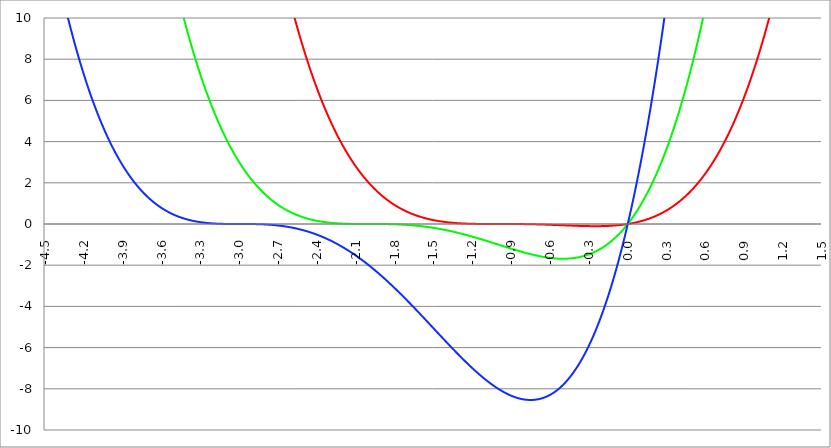
| Category | Series 1 | Series 0 | Series 2 |
|---|---|---|---|
| -4.5 | 192.938 | 70.312 | 15.188 |
| -4.497 | 192.314 | 70.013 | 15.086 |
| -4.494 | 191.691 | 69.714 | 14.986 |
| -4.491 | 191.07 | 69.417 | 14.886 |
| -4.488 | 190.451 | 69.12 | 14.786 |
| -4.484999999999999 | 189.833 | 68.824 | 14.687 |
| -4.482 | 189.216 | 68.529 | 14.589 |
| -4.479 | 188.601 | 68.236 | 14.491 |
| -4.476 | 187.988 | 67.943 | 14.393 |
| -4.472999999999999 | 187.376 | 67.651 | 14.296 |
| -4.469999999999999 | 186.765 | 67.359 | 14.199 |
| -4.466999999999999 | 186.156 | 67.069 | 14.103 |
| -4.463999999999999 | 185.549 | 66.78 | 14.007 |
| -4.460999999999998 | 184.943 | 66.492 | 13.912 |
| -4.457999999999998 | 184.338 | 66.204 | 13.817 |
| -4.454999999999998 | 183.735 | 65.918 | 13.723 |
| -4.451999999999998 | 183.133 | 65.632 | 13.629 |
| -4.448999999999998 | 182.533 | 65.347 | 13.535 |
| -4.445999999999998 | 181.935 | 65.064 | 13.442 |
| -4.442999999999998 | 181.337 | 64.781 | 13.35 |
| -4.439999999999997 | 180.742 | 64.499 | 13.258 |
| -4.436999999999997 | 180.147 | 64.218 | 13.166 |
| -4.433999999999997 | 179.555 | 63.938 | 13.075 |
| -4.430999999999997 | 178.963 | 63.659 | 12.984 |
| -4.427999999999997 | 178.373 | 63.38 | 12.894 |
| -4.424999999999997 | 177.785 | 63.103 | 12.804 |
| -4.421999999999997 | 177.198 | 62.826 | 12.715 |
| -4.418999999999997 | 176.612 | 62.551 | 12.626 |
| -4.415999999999997 | 176.028 | 62.276 | 12.538 |
| -4.412999999999997 | 175.446 | 62.002 | 12.45 |
| -4.409999999999996 | 174.865 | 61.729 | 12.362 |
| -4.406999999999996 | 174.285 | 61.457 | 12.275 |
| -4.403999999999996 | 173.706 | 61.186 | 12.188 |
| -4.400999999999996 | 173.13 | 60.916 | 12.102 |
| -4.397999999999996 | 172.554 | 60.646 | 12.016 |
| -4.394999999999996 | 171.98 | 60.378 | 11.931 |
| -4.391999999999996 | 171.408 | 60.11 | 11.846 |
| -4.388999999999996 | 170.836 | 59.843 | 11.762 |
| -4.385999999999996 | 170.267 | 59.577 | 11.678 |
| -4.382999999999996 | 169.698 | 59.312 | 11.594 |
| -4.379999999999995 | 169.131 | 59.048 | 11.511 |
| -4.376999999999995 | 168.566 | 58.785 | 11.428 |
| -4.373999999999995 | 168.002 | 58.522 | 11.346 |
| -4.370999999999995 | 167.439 | 58.261 | 11.264 |
| -4.367999999999995 | 166.878 | 58 | 11.183 |
| -4.364999999999995 | 166.318 | 57.74 | 11.102 |
| -4.361999999999995 | 165.76 | 57.481 | 11.021 |
| -4.358999999999995 | 165.203 | 57.223 | 10.941 |
| -4.355999999999994 | 164.647 | 56.966 | 10.861 |
| -4.352999999999994 | 164.093 | 56.709 | 10.782 |
| -4.349999999999994 | 163.54 | 56.454 | 10.703 |
| -4.346999999999994 | 162.988 | 56.199 | 10.624 |
| -4.343999999999994 | 162.438 | 55.945 | 10.546 |
| -4.340999999999994 | 161.89 | 55.692 | 10.468 |
| -4.337999999999994 | 161.342 | 55.44 | 10.391 |
| -4.334999999999994 | 160.797 | 55.189 | 10.314 |
| -4.331999999999994 | 160.252 | 54.938 | 10.238 |
| -4.328999999999993 | 159.709 | 54.689 | 10.162 |
| -4.325999999999993 | 159.167 | 54.44 | 10.086 |
| -4.322999999999993 | 158.627 | 54.192 | 10.011 |
| -4.319999999999993 | 158.088 | 53.945 | 9.936 |
| -4.316999999999993 | 157.55 | 53.698 | 9.861 |
| -4.313999999999993 | 157.014 | 53.453 | 9.787 |
| -4.310999999999993 | 156.479 | 53.208 | 9.714 |
| -4.307999999999993 | 155.945 | 52.964 | 9.64 |
| -4.304999999999993 | 155.413 | 52.721 | 9.568 |
| -4.301999999999992 | 154.882 | 52.479 | 9.495 |
| -4.298999999999992 | 154.353 | 52.238 | 9.423 |
| -4.295999999999992 | 153.825 | 51.997 | 9.351 |
| -4.292999999999992 | 153.298 | 51.757 | 9.28 |
| -4.289999999999992 | 152.772 | 51.519 | 9.209 |
| -4.286999999999992 | 152.248 | 51.28 | 9.139 |
| -4.283999999999992 | 151.726 | 51.043 | 9.069 |
| -4.280999999999992 | 151.204 | 50.807 | 8.999 |
| -4.277999999999992 | 150.684 | 50.571 | 8.93 |
| -4.274999999999991 | 150.165 | 50.336 | 8.861 |
| -4.271999999999991 | 149.648 | 50.102 | 8.792 |
| -4.268999999999991 | 149.132 | 49.869 | 8.724 |
| -4.265999999999991 | 148.617 | 49.636 | 8.656 |
| -4.262999999999991 | 148.104 | 49.405 | 8.589 |
| -4.259999999999991 | 147.592 | 49.174 | 8.522 |
| -4.256999999999991 | 147.081 | 48.944 | 8.455 |
| -4.253999999999991 | 146.572 | 48.715 | 8.389 |
| -4.250999999999991 | 146.064 | 48.486 | 8.323 |
| -4.24799999999999 | 145.557 | 48.258 | 8.257 |
| -4.24499999999999 | 145.051 | 48.032 | 8.192 |
| -4.24199999999999 | 144.547 | 47.805 | 8.127 |
| -4.23899999999999 | 144.044 | 47.58 | 8.063 |
| -4.23599999999999 | 143.543 | 47.356 | 7.999 |
| -4.23299999999999 | 143.043 | 47.132 | 7.935 |
| -4.22999999999999 | 142.544 | 46.909 | 7.871 |
| -4.22699999999999 | 142.046 | 46.687 | 7.808 |
| -4.22399999999999 | 141.55 | 46.465 | 7.746 |
| -4.220999999999989 | 141.055 | 46.245 | 7.684 |
| -4.217999999999989 | 140.561 | 46.025 | 7.622 |
| -4.214999999999989 | 140.069 | 45.806 | 7.56 |
| -4.21199999999999 | 139.577 | 45.587 | 7.499 |
| -4.208999999999989 | 139.087 | 45.37 | 7.438 |
| -4.205999999999989 | 138.599 | 45.153 | 7.378 |
| -4.202999999999989 | 138.112 | 44.937 | 7.317 |
| -4.199999999999989 | 137.626 | 44.722 | 7.258 |
| -4.196999999999988 | 137.141 | 44.507 | 7.198 |
| -4.193999999999988 | 136.657 | 44.293 | 7.139 |
| -4.190999999999988 | 136.175 | 44.08 | 7.08 |
| -4.187999999999988 | 135.694 | 43.868 | 7.022 |
| -4.184999999999988 | 135.215 | 43.657 | 6.964 |
| -4.181999999999988 | 134.736 | 43.446 | 6.906 |
| -4.178999999999988 | 134.259 | 43.236 | 6.849 |
| -4.175999999999988 | 133.783 | 43.027 | 6.792 |
| -4.172999999999988 | 133.309 | 42.818 | 6.735 |
| -4.169999999999987 | 132.835 | 42.61 | 6.679 |
| -4.166999999999987 | 132.363 | 42.403 | 6.623 |
| -4.163999999999987 | 131.893 | 42.197 | 6.567 |
| -4.160999999999987 | 131.423 | 41.992 | 6.512 |
| -4.157999999999987 | 130.955 | 41.787 | 6.457 |
| -4.154999999999987 | 130.488 | 41.583 | 6.402 |
| -4.151999999999987 | 130.022 | 41.379 | 6.348 |
| -4.148999999999987 | 129.557 | 41.177 | 6.294 |
| -4.145999999999987 | 129.094 | 40.975 | 6.24 |
| -4.142999999999986 | 128.632 | 40.774 | 6.187 |
| -4.139999999999986 | 128.171 | 40.573 | 6.134 |
| -4.136999999999986 | 127.711 | 40.374 | 6.081 |
| -4.133999999999986 | 127.253 | 40.175 | 6.029 |
| -4.130999999999986 | 126.796 | 39.977 | 5.976 |
| -4.127999999999986 | 126.34 | 39.779 | 5.925 |
| -4.124999999999986 | 125.885 | 39.582 | 5.873 |
| -4.121999999999986 | 125.432 | 39.386 | 5.822 |
| -4.118999999999986 | 124.979 | 39.191 | 5.771 |
| -4.115999999999985 | 124.528 | 38.996 | 5.721 |
| -4.112999999999985 | 124.078 | 38.802 | 5.671 |
| -4.109999999999985 | 123.63 | 38.609 | 5.621 |
| -4.106999999999985 | 123.182 | 38.417 | 5.571 |
| -4.103999999999985 | 122.736 | 38.225 | 5.522 |
| -4.100999999999985 | 122.291 | 38.034 | 5.473 |
| -4.097999999999985 | 121.847 | 37.843 | 5.425 |
| -4.094999999999985 | 121.405 | 37.654 | 5.376 |
| -4.091999999999984 | 120.963 | 37.465 | 5.328 |
| -4.088999999999984 | 120.523 | 37.276 | 5.281 |
| -4.085999999999984 | 120.084 | 37.089 | 5.233 |
| -4.082999999999984 | 119.646 | 36.902 | 5.186 |
| -4.079999999999984 | 119.21 | 36.716 | 5.14 |
| -4.076999999999984 | 118.774 | 36.53 | 5.093 |
| -4.073999999999984 | 118.34 | 36.345 | 5.047 |
| -4.070999999999984 | 117.907 | 36.161 | 5.001 |
| -4.067999999999984 | 117.475 | 35.978 | 4.956 |
| -4.064999999999984 | 117.045 | 35.795 | 4.91 |
| -4.061999999999983 | 116.615 | 35.613 | 4.865 |
| -4.058999999999983 | 116.187 | 35.431 | 4.821 |
| -4.055999999999983 | 115.76 | 35.251 | 4.776 |
| -4.052999999999983 | 115.334 | 35.071 | 4.732 |
| -4.049999999999983 | 114.909 | 34.891 | 4.688 |
| -4.046999999999983 | 114.486 | 34.713 | 4.645 |
| -4.043999999999983 | 114.063 | 34.535 | 4.602 |
| -4.040999999999983 | 113.642 | 34.357 | 4.559 |
| -4.037999999999982 | 113.222 | 34.181 | 4.516 |
| -4.034999999999982 | 112.803 | 34.005 | 4.474 |
| -4.031999999999982 | 112.385 | 33.829 | 4.432 |
| -4.028999999999982 | 111.968 | 33.655 | 4.39 |
| -4.025999999999982 | 111.553 | 33.481 | 4.348 |
| -4.022999999999982 | 111.138 | 33.307 | 4.307 |
| -4.019999999999982 | 110.725 | 33.134 | 4.266 |
| -4.016999999999982 | 110.313 | 32.962 | 4.225 |
| -4.013999999999982 | 109.902 | 32.791 | 4.185 |
| -4.010999999999981 | 109.493 | 32.62 | 4.145 |
| -4.007999999999981 | 109.084 | 32.45 | 4.105 |
| -4.004999999999981 | 108.677 | 32.281 | 4.065 |
| -4.001999999999981 | 108.27 | 32.112 | 4.026 |
| -3.998999999999981 | 107.865 | 31.944 | 3.987 |
| -3.995999999999981 | 107.461 | 31.777 | 3.948 |
| -3.992999999999981 | 107.058 | 31.61 | 3.91 |
| -3.989999999999981 | 106.656 | 31.444 | 3.871 |
| -3.986999999999981 | 106.256 | 31.278 | 3.834 |
| -3.98399999999998 | 105.856 | 31.113 | 3.796 |
| -3.98099999999998 | 105.458 | 30.949 | 3.758 |
| -3.97799999999998 | 105.06 | 30.785 | 3.721 |
| -3.97499999999998 | 104.664 | 30.622 | 3.684 |
| -3.97199999999998 | 104.269 | 30.46 | 3.648 |
| -3.96899999999998 | 103.875 | 30.298 | 3.611 |
| -3.96599999999998 | 103.482 | 30.137 | 3.575 |
| -3.96299999999998 | 103.091 | 29.977 | 3.539 |
| -3.95999999999998 | 102.7 | 29.817 | 3.504 |
| -3.956999999999979 | 102.31 | 29.658 | 3.468 |
| -3.953999999999979 | 101.922 | 29.499 | 3.433 |
| -3.950999999999979 | 101.535 | 29.341 | 3.398 |
| -3.94799999999998 | 101.149 | 29.184 | 3.364 |
| -3.944999999999979 | 100.763 | 29.027 | 3.329 |
| -3.941999999999979 | 100.379 | 28.871 | 3.295 |
| -3.938999999999979 | 99.996 | 28.716 | 3.261 |
| -3.935999999999979 | 99.615 | 28.561 | 3.228 |
| -3.932999999999978 | 99.234 | 28.407 | 3.194 |
| -3.929999999999978 | 98.854 | 28.253 | 3.161 |
| -3.926999999999978 | 98.476 | 28.1 | 3.128 |
| -3.923999999999978 | 98.098 | 27.948 | 3.096 |
| -3.920999999999978 | 97.722 | 27.796 | 3.063 |
| -3.917999999999978 | 97.346 | 27.645 | 3.031 |
| -3.914999999999978 | 96.972 | 27.494 | 2.999 |
| -3.911999999999978 | 96.599 | 27.344 | 2.967 |
| -3.908999999999978 | 96.227 | 27.195 | 2.936 |
| -3.905999999999977 | 95.856 | 27.046 | 2.905 |
| -3.902999999999977 | 95.486 | 26.898 | 2.874 |
| -3.899999999999977 | 95.117 | 26.75 | 2.843 |
| -3.896999999999977 | 94.749 | 26.603 | 2.813 |
| -3.893999999999977 | 94.383 | 26.457 | 2.782 |
| -3.890999999999977 | 94.017 | 26.311 | 2.752 |
| -3.887999999999977 | 93.652 | 26.166 | 2.722 |
| -3.884999999999977 | 93.289 | 26.021 | 2.693 |
| -3.881999999999977 | 92.926 | 25.877 | 2.664 |
| -3.878999999999976 | 92.565 | 25.734 | 2.634 |
| -3.875999999999976 | 92.204 | 25.591 | 2.606 |
| -3.872999999999976 | 91.845 | 25.448 | 2.577 |
| -3.869999999999976 | 91.486 | 25.307 | 2.548 |
| -3.866999999999976 | 91.129 | 25.166 | 2.52 |
| -3.863999999999976 | 90.773 | 25.025 | 2.492 |
| -3.860999999999976 | 90.418 | 24.885 | 2.464 |
| -3.857999999999976 | 90.064 | 24.746 | 2.437 |
| -3.854999999999976 | 89.71 | 24.607 | 2.409 |
| -3.851999999999975 | 89.358 | 24.469 | 2.382 |
| -3.848999999999975 | 89.007 | 24.331 | 2.355 |
| -3.845999999999975 | 88.657 | 24.194 | 2.329 |
| -3.842999999999975 | 88.308 | 24.057 | 2.302 |
| -3.839999999999975 | 87.96 | 23.921 | 2.276 |
| -3.836999999999975 | 87.613 | 23.786 | 2.25 |
| -3.833999999999975 | 87.267 | 23.651 | 2.224 |
| -3.830999999999975 | 86.922 | 23.517 | 2.198 |
| -3.827999999999974 | 86.579 | 23.383 | 2.173 |
| -3.824999999999974 | 86.236 | 23.25 | 2.148 |
| -3.821999999999974 | 85.894 | 23.117 | 2.123 |
| -3.818999999999974 | 85.553 | 22.985 | 2.098 |
| -3.815999999999974 | 85.213 | 22.854 | 2.073 |
| -3.812999999999974 | 84.874 | 22.723 | 2.049 |
| -3.809999999999974 | 84.536 | 22.592 | 2.025 |
| -3.806999999999974 | 84.2 | 22.462 | 2.001 |
| -3.803999999999974 | 83.864 | 22.333 | 1.977 |
| -3.800999999999973 | 83.529 | 22.204 | 1.953 |
| -3.797999999999973 | 83.195 | 22.076 | 1.93 |
| -3.794999999999973 | 82.862 | 21.949 | 1.907 |
| -3.791999999999973 | 82.531 | 21.821 | 1.884 |
| -3.788999999999973 | 82.2 | 21.695 | 1.861 |
| -3.785999999999973 | 81.87 | 21.569 | 1.838 |
| -3.782999999999973 | 81.541 | 21.443 | 1.816 |
| -3.779999999999973 | 81.213 | 21.318 | 1.794 |
| -3.776999999999973 | 80.886 | 21.194 | 1.772 |
| -3.773999999999972 | 80.56 | 21.07 | 1.75 |
| -3.770999999999972 | 80.235 | 20.947 | 1.728 |
| -3.767999999999972 | 79.911 | 20.824 | 1.707 |
| -3.764999999999972 | 79.589 | 20.701 | 1.686 |
| -3.761999999999972 | 79.267 | 20.58 | 1.664 |
| -3.758999999999972 | 78.946 | 20.458 | 1.644 |
| -3.755999999999972 | 78.625 | 20.338 | 1.623 |
| -3.752999999999972 | 78.306 | 20.217 | 1.602 |
| -3.749999999999972 | 77.988 | 20.098 | 1.582 |
| -3.746999999999971 | 77.671 | 19.978 | 1.562 |
| -3.743999999999971 | 77.355 | 19.86 | 1.542 |
| -3.740999999999971 | 77.04 | 19.742 | 1.522 |
| -3.737999999999971 | 76.725 | 19.624 | 1.502 |
| -3.734999999999971 | 76.412 | 19.507 | 1.483 |
| -3.731999999999971 | 76.1 | 19.39 | 1.464 |
| -3.728999999999971 | 75.788 | 19.274 | 1.445 |
| -3.725999999999971 | 75.478 | 19.159 | 1.426 |
| -3.72299999999997 | 75.169 | 19.044 | 1.407 |
| -3.71999999999997 | 74.86 | 18.929 | 1.388 |
| -3.71699999999997 | 74.552 | 18.815 | 1.37 |
| -3.71399999999997 | 74.246 | 18.701 | 1.352 |
| -3.71099999999997 | 73.94 | 18.588 | 1.334 |
| -3.70799999999997 | 73.635 | 18.476 | 1.316 |
| -3.70499999999997 | 73.331 | 18.364 | 1.298 |
| -3.70199999999997 | 73.029 | 18.252 | 1.281 |
| -3.69899999999997 | 72.727 | 18.141 | 1.263 |
| -3.695999999999969 | 72.426 | 18.031 | 1.246 |
| -3.692999999999969 | 72.125 | 17.921 | 1.229 |
| -3.689999999999969 | 71.826 | 17.811 | 1.212 |
| -3.686999999999969 | 71.528 | 17.702 | 1.195 |
| -3.683999999999969 | 71.231 | 17.593 | 1.179 |
| -3.680999999999969 | 70.934 | 17.485 | 1.163 |
| -3.677999999999969 | 70.639 | 17.378 | 1.146 |
| -3.674999999999969 | 70.344 | 17.27 | 1.13 |
| -3.671999999999969 | 70.051 | 17.164 | 1.114 |
| -3.668999999999968 | 69.758 | 17.058 | 1.099 |
| -3.665999999999968 | 69.466 | 16.952 | 1.083 |
| -3.662999999999968 | 69.175 | 16.847 | 1.068 |
| -3.659999999999968 | 68.885 | 16.742 | 1.052 |
| -3.656999999999968 | 68.596 | 16.638 | 1.037 |
| -3.653999999999968 | 68.308 | 16.534 | 1.022 |
| -3.650999999999968 | 68.021 | 16.431 | 1.007 |
| -3.647999999999968 | 67.734 | 16.328 | 0.993 |
| -3.644999999999968 | 67.449 | 16.225 | 0.978 |
| -3.641999999999967 | 67.164 | 16.124 | 0.964 |
| -3.638999999999967 | 66.881 | 16.022 | 0.949 |
| -3.635999999999967 | 66.598 | 15.921 | 0.935 |
| -3.632999999999967 | 66.316 | 15.821 | 0.921 |
| -3.629999999999967 | 66.035 | 15.721 | 0.908 |
| -3.626999999999967 | 65.755 | 15.621 | 0.894 |
| -3.623999999999967 | 65.476 | 15.522 | 0.881 |
| -3.620999999999967 | 65.197 | 15.423 | 0.867 |
| -3.617999999999966 | 64.92 | 15.325 | 0.854 |
| -3.614999999999966 | 64.643 | 15.227 | 0.841 |
| -3.611999999999966 | 64.368 | 15.13 | 0.828 |
| -3.608999999999966 | 64.093 | 15.033 | 0.815 |
| -3.605999999999966 | 63.819 | 14.937 | 0.802 |
| -3.602999999999966 | 63.546 | 14.841 | 0.79 |
| -3.599999999999966 | 63.274 | 14.746 | 0.778 |
| -3.596999999999966 | 63.002 | 14.651 | 0.765 |
| -3.593999999999966 | 62.732 | 14.556 | 0.753 |
| -3.590999999999966 | 62.462 | 14.462 | 0.741 |
| -3.587999999999965 | 62.194 | 14.368 | 0.729 |
| -3.584999999999965 | 61.926 | 14.275 | 0.718 |
| -3.581999999999965 | 61.659 | 14.182 | 0.706 |
| -3.578999999999965 | 61.393 | 14.09 | 0.695 |
| -3.575999999999965 | 61.127 | 13.998 | 0.683 |
| -3.572999999999965 | 60.863 | 13.907 | 0.672 |
| -3.569999999999965 | 60.599 | 13.816 | 0.661 |
| -3.566999999999965 | 60.337 | 13.725 | 0.65 |
| -3.563999999999965 | 60.075 | 13.635 | 0.639 |
| -3.560999999999964 | 59.814 | 13.545 | 0.629 |
| -3.557999999999964 | 59.554 | 13.456 | 0.618 |
| -3.554999999999964 | 59.294 | 13.367 | 0.608 |
| -3.551999999999964 | 59.036 | 13.278 | 0.597 |
| -3.548999999999964 | 58.778 | 13.19 | 0.587 |
| -3.545999999999964 | 58.521 | 13.103 | 0.577 |
| -3.542999999999964 | 58.265 | 13.016 | 0.567 |
| -3.539999999999964 | 58.01 | 12.929 | 0.557 |
| -3.536999999999963 | 57.756 | 12.843 | 0.548 |
| -3.533999999999963 | 57.502 | 12.757 | 0.538 |
| -3.530999999999963 | 57.25 | 12.671 | 0.529 |
| -3.527999999999963 | 56.998 | 12.586 | 0.519 |
| -3.524999999999963 | 56.747 | 12.502 | 0.51 |
| -3.521999999999963 | 56.497 | 12.417 | 0.501 |
| -3.518999999999963 | 56.248 | 12.334 | 0.492 |
| -3.515999999999963 | 55.999 | 12.25 | 0.483 |
| -3.512999999999963 | 55.751 | 12.167 | 0.474 |
| -3.509999999999962 | 55.505 | 12.085 | 0.466 |
| -3.506999999999962 | 55.258 | 12.003 | 0.457 |
| -3.503999999999962 | 55.013 | 11.921 | 0.449 |
| -3.500999999999962 | 54.769 | 11.84 | 0.44 |
| -3.497999999999962 | 54.525 | 11.759 | 0.432 |
| -3.494999999999962 | 54.282 | 11.678 | 0.424 |
| -3.491999999999962 | 54.04 | 11.598 | 0.416 |
| -3.488999999999962 | 53.799 | 11.518 | 0.408 |
| -3.485999999999962 | 53.559 | 11.439 | 0.4 |
| -3.482999999999961 | 53.319 | 11.36 | 0.392 |
| -3.479999999999961 | 53.08 | 11.281 | 0.385 |
| -3.476999999999961 | 52.842 | 11.203 | 0.377 |
| -3.473999999999961 | 52.605 | 11.126 | 0.37 |
| -3.470999999999961 | 52.369 | 11.048 | 0.363 |
| -3.467999999999961 | 52.133 | 10.971 | 0.355 |
| -3.464999999999961 | 51.898 | 10.895 | 0.348 |
| -3.461999999999961 | 51.664 | 10.819 | 0.341 |
| -3.458999999999961 | 51.431 | 10.743 | 0.334 |
| -3.45599999999996 | 51.199 | 10.667 | 0.328 |
| -3.45299999999996 | 50.967 | 10.592 | 0.321 |
| -3.44999999999996 | 50.736 | 10.518 | 0.314 |
| -3.44699999999996 | 50.506 | 10.444 | 0.308 |
| -3.44399999999996 | 50.277 | 10.37 | 0.301 |
| -3.44099999999996 | 50.048 | 10.296 | 0.295 |
| -3.43799999999996 | 49.82 | 10.223 | 0.289 |
| -3.43499999999996 | 49.593 | 10.15 | 0.283 |
| -3.431999999999959 | 49.367 | 10.078 | 0.277 |
| -3.428999999999959 | 49.142 | 10.006 | 0.271 |
| -3.425999999999959 | 48.917 | 9.934 | 0.265 |
| -3.422999999999959 | 48.693 | 9.863 | 0.259 |
| -3.419999999999959 | 48.47 | 9.792 | 0.253 |
| -3.416999999999959 | 48.248 | 9.722 | 0.248 |
| -3.413999999999959 | 48.026 | 9.652 | 0.242 |
| -3.410999999999959 | 47.805 | 9.582 | 0.237 |
| -3.407999999999959 | 47.585 | 9.513 | 0.231 |
| -3.404999999999958 | 47.366 | 9.444 | 0.226 |
| -3.401999999999958 | 47.147 | 9.375 | 0.221 |
| -3.398999999999958 | 46.929 | 9.307 | 0.216 |
| -3.395999999999958 | 46.712 | 9.239 | 0.211 |
| -3.392999999999958 | 46.496 | 9.171 | 0.206 |
| -3.389999999999958 | 46.28 | 9.104 | 0.201 |
| -3.386999999999958 | 46.065 | 9.037 | 0.196 |
| -3.383999999999958 | 45.851 | 8.971 | 0.192 |
| -3.380999999999958 | 45.638 | 8.905 | 0.187 |
| -3.377999999999957 | 45.425 | 8.839 | 0.182 |
| -3.374999999999957 | 45.213 | 8.774 | 0.178 |
| -3.371999999999957 | 45.002 | 8.709 | 0.174 |
| -3.368999999999957 | 44.792 | 8.644 | 0.169 |
| -3.365999999999957 | 44.582 | 8.58 | 0.165 |
| -3.362999999999957 | 44.373 | 8.516 | 0.161 |
| -3.359999999999957 | 44.165 | 8.452 | 0.157 |
| -3.356999999999957 | 43.957 | 8.389 | 0.153 |
| -3.353999999999957 | 43.75 | 8.326 | 0.149 |
| -3.350999999999956 | 43.544 | 8.263 | 0.145 |
| -3.347999999999956 | 43.339 | 8.201 | 0.141 |
| -3.344999999999956 | 43.134 | 8.139 | 0.137 |
| -3.341999999999956 | 42.931 | 8.077 | 0.134 |
| -3.338999999999956 | 42.727 | 8.016 | 0.13 |
| -3.335999999999956 | 42.525 | 7.955 | 0.127 |
| -3.332999999999956 | 42.323 | 7.895 | 0.123 |
| -3.329999999999956 | 42.122 | 7.834 | 0.12 |
| -3.326999999999955 | 41.922 | 7.774 | 0.116 |
| -3.323999999999955 | 41.722 | 7.715 | 0.113 |
| -3.320999999999955 | 41.524 | 7.656 | 0.11 |
| -3.317999999999955 | 41.325 | 7.597 | 0.107 |
| -3.314999999999955 | 41.128 | 7.538 | 0.104 |
| -3.311999999999955 | 40.931 | 7.48 | 0.101 |
| -3.308999999999955 | 40.735 | 7.422 | 0.098 |
| -3.305999999999955 | 40.54 | 7.364 | 0.095 |
| -3.302999999999955 | 40.345 | 7.307 | 0.092 |
| -3.299999999999954 | 40.151 | 7.25 | 0.089 |
| -3.296999999999954 | 39.958 | 7.193 | 0.086 |
| -3.293999999999954 | 39.765 | 7.137 | 0.084 |
| -3.290999999999954 | 39.573 | 7.081 | 0.081 |
| -3.287999999999954 | 39.382 | 7.026 | 0.079 |
| -3.284999999999954 | 39.192 | 6.97 | 0.076 |
| -3.281999999999954 | 39.002 | 6.915 | 0.074 |
| -3.278999999999954 | 38.813 | 6.86 | 0.071 |
| -3.275999999999954 | 38.624 | 6.806 | 0.069 |
| -3.272999999999953 | 38.437 | 6.752 | 0.067 |
| -3.269999999999953 | 38.249 | 6.698 | 0.064 |
| -3.266999999999953 | 38.063 | 6.645 | 0.062 |
| -3.263999999999953 | 37.877 | 6.592 | 0.06 |
| -3.260999999999953 | 37.692 | 6.539 | 0.058 |
| -3.257999999999953 | 37.508 | 6.486 | 0.056 |
| -3.254999999999953 | 37.324 | 6.434 | 0.054 |
| -3.251999999999953 | 37.141 | 6.382 | 0.052 |
| -3.248999999999952 | 36.959 | 6.33 | 0.05 |
| -3.245999999999952 | 36.777 | 6.279 | 0.048 |
| -3.242999999999952 | 36.596 | 6.228 | 0.047 |
| -3.239999999999952 | 36.416 | 6.177 | 0.045 |
| -3.236999999999952 | 36.236 | 6.127 | 0.043 |
| -3.233999999999952 | 36.057 | 6.077 | 0.041 |
| -3.230999999999952 | 35.879 | 6.027 | 0.04 |
| -3.227999999999952 | 35.701 | 5.978 | 0.038 |
| -3.224999999999952 | 35.524 | 5.928 | 0.037 |
| -3.221999999999952 | 35.347 | 5.879 | 0.035 |
| -3.218999999999951 | 35.172 | 5.831 | 0.034 |
| -3.215999999999951 | 34.997 | 5.783 | 0.032 |
| -3.212999999999951 | 34.822 | 5.734 | 0.031 |
| -3.209999999999951 | 34.648 | 5.687 | 0.03 |
| -3.206999999999951 | 34.475 | 5.639 | 0.028 |
| -3.203999999999951 | 34.303 | 5.592 | 0.027 |
| -3.200999999999951 | 34.131 | 5.545 | 0.026 |
| -3.197999999999951 | 33.96 | 5.499 | 0.025 |
| -3.194999999999951 | 33.789 | 5.452 | 0.024 |
| -3.19199999999995 | 33.619 | 5.406 | 0.023 |
| -3.18899999999995 | 33.45 | 5.36 | 0.022 |
| -3.18599999999995 | 33.281 | 5.315 | 0.021 |
| -3.18299999999995 | 33.113 | 5.27 | 0.02 |
| -3.17999999999995 | 32.946 | 5.225 | 0.019 |
| -3.17699999999995 | 32.779 | 5.18 | 0.018 |
| -3.17399999999995 | 32.613 | 5.136 | 0.017 |
| -3.17099999999995 | 32.447 | 5.092 | 0.016 |
| -3.16799999999995 | 32.282 | 5.048 | 0.015 |
| -3.164999999999949 | 32.118 | 5.004 | 0.014 |
| -3.161999999999949 | 31.954 | 4.961 | 0.013 |
| -3.158999999999949 | 31.791 | 4.918 | 0.013 |
| -3.155999999999949 | 31.629 | 4.875 | 0.012 |
| -3.152999999999949 | 31.467 | 4.833 | 0.011 |
| -3.149999999999949 | 31.306 | 4.791 | 0.011 |
| -3.146999999999949 | 31.145 | 4.749 | 0.01 |
| -3.143999999999949 | 30.985 | 4.707 | 0.009 |
| -3.140999999999948 | 30.826 | 4.666 | 0.009 |
| -3.137999999999948 | 30.667 | 4.625 | 0.008 |
| -3.134999999999948 | 30.509 | 4.584 | 0.008 |
| -3.131999999999948 | 30.352 | 4.543 | 0.007 |
| -3.128999999999948 | 30.195 | 4.503 | 0.007 |
| -3.125999999999948 | 30.039 | 4.463 | 0.006 |
| -3.122999999999948 | 29.883 | 4.423 | 0.006 |
| -3.119999999999948 | 29.728 | 4.383 | 0.005 |
| -3.116999999999948 | 29.573 | 4.344 | 0.005 |
| -3.113999999999947 | 29.419 | 4.305 | 0.005 |
| -3.110999999999947 | 29.266 | 4.266 | 0.004 |
| -3.107999999999947 | 29.113 | 4.228 | 0.004 |
| -3.104999999999947 | 28.961 | 4.189 | 0.004 |
| -3.101999999999947 | 28.81 | 4.151 | 0.003 |
| -3.098999999999947 | 28.659 | 4.114 | 0.003 |
| -3.095999999999947 | 28.509 | 4.076 | 0.003 |
| -3.092999999999947 | 28.359 | 4.039 | 0.002 |
| -3.089999999999947 | 28.21 | 4.002 | 0.002 |
| -3.086999999999946 | 28.061 | 3.965 | 0.002 |
| -3.083999999999946 | 27.913 | 3.928 | 0.002 |
| -3.080999999999946 | 27.766 | 3.892 | 0.002 |
| -3.077999999999946 | 27.619 | 3.856 | 0.001 |
| -3.074999999999946 | 27.473 | 3.82 | 0.001 |
| -3.071999999999946 | 27.327 | 3.784 | 0.001 |
| -3.068999999999946 | 27.182 | 3.749 | 0.001 |
| -3.065999999999946 | 27.037 | 3.714 | 0.001 |
| -3.062999999999946 | 26.893 | 3.679 | 0.001 |
| -3.059999999999945 | 26.75 | 3.645 | 0.001 |
| -3.056999999999945 | 26.607 | 3.61 | 0.001 |
| -3.053999999999945 | 26.465 | 3.576 | 0 |
| -3.050999999999945 | 26.323 | 3.542 | 0 |
| -3.047999999999945 | 26.182 | 3.508 | 0 |
| -3.044999999999945 | 26.042 | 3.475 | 0 |
| -3.041999999999945 | 25.902 | 3.442 | 0 |
| -3.038999999999945 | 25.762 | 3.409 | 0 |
| -3.035999999999945 | 25.623 | 3.376 | 0 |
| -3.032999999999944 | 25.485 | 3.343 | 0 |
| -3.029999999999944 | 25.347 | 3.311 | 0 |
| -3.026999999999944 | 25.21 | 3.279 | 0 |
| -3.023999999999944 | 25.073 | 3.247 | 0 |
| -3.020999999999944 | 24.937 | 3.215 | 0 |
| -3.017999999999944 | 24.802 | 3.184 | 0 |
| -3.014999999999944 | 24.667 | 3.153 | 0 |
| -3.011999999999944 | 24.532 | 3.122 | 0 |
| -3.008999999999943 | 24.398 | 3.091 | 0 |
| -3.005999999999943 | 24.265 | 3.06 | 0 |
| -3.002999999999943 | 24.132 | 3.03 | 0 |
| -2.999999999999943 | 24 | 3 | 0 |
| -2.996999999999943 | 23.868 | 2.97 | 0 |
| -2.993999999999943 | 23.737 | 2.94 | 0 |
| -2.990999999999943 | 23.606 | 2.911 | 0 |
| -2.987999999999943 | 23.476 | 2.882 | 0 |
| -2.984999999999943 | 23.347 | 2.853 | 0 |
| -2.981999999999942 | 23.218 | 2.824 | 0 |
| -2.978999999999942 | 23.089 | 2.795 | 0 |
| -2.975999999999942 | 22.961 | 2.767 | 0 |
| -2.972999999999942 | 22.834 | 2.739 | 0 |
| -2.969999999999942 | 22.707 | 2.711 | 0 |
| -2.966999999999942 | 22.58 | 2.683 | 0 |
| -2.963999999999942 | 22.454 | 2.655 | 0 |
| -2.960999999999942 | 22.329 | 2.628 | 0 |
| -2.957999999999942 | 22.204 | 2.601 | 0 |
| -2.954999999999941 | 22.08 | 2.574 | 0 |
| -2.951999999999941 | 21.956 | 2.547 | 0 |
| -2.948999999999941 | 21.833 | 2.52 | 0 |
| -2.945999999999941 | 21.71 | 2.494 | 0 |
| -2.942999999999941 | 21.588 | 2.468 | -0.001 |
| -2.939999999999941 | 21.466 | 2.442 | -0.001 |
| -2.936999999999941 | 21.345 | 2.416 | -0.001 |
| -2.933999999999941 | 21.224 | 2.391 | -0.001 |
| -2.930999999999941 | 21.104 | 2.365 | -0.001 |
| -2.92799999999994 | 20.984 | 2.34 | -0.001 |
| -2.92499999999994 | 20.865 | 2.315 | -0.001 |
| -2.92199999999994 | 20.746 | 2.29 | -0.001 |
| -2.91899999999994 | 20.628 | 2.266 | -0.002 |
| -2.91599999999994 | 20.51 | 2.241 | -0.002 |
| -2.91299999999994 | 20.393 | 2.217 | -0.002 |
| -2.90999999999994 | 20.277 | 2.193 | -0.002 |
| -2.90699999999994 | 20.16 | 2.169 | -0.002 |
| -2.903999999999939 | 20.045 | 2.145 | -0.003 |
| -2.900999999999939 | 19.929 | 2.122 | -0.003 |
| -2.897999999999939 | 19.815 | 2.099 | -0.003 |
| -2.894999999999939 | 19.7 | 2.075 | -0.003 |
| -2.891999999999939 | 19.587 | 2.053 | -0.004 |
| -2.888999999999939 | 19.473 | 2.03 | -0.004 |
| -2.885999999999939 | 19.361 | 2.007 | -0.004 |
| -2.882999999999939 | 19.248 | 1.985 | -0.005 |
| -2.879999999999939 | 19.137 | 1.963 | -0.005 |
| -2.876999999999938 | 19.025 | 1.941 | -0.005 |
| -2.873999999999938 | 18.915 | 1.919 | -0.006 |
| -2.870999999999938 | 18.804 | 1.897 | -0.006 |
| -2.867999999999938 | 18.694 | 1.876 | -0.007 |
| -2.864999999999938 | 18.585 | 1.854 | -0.007 |
| -2.861999999999938 | 18.476 | 1.833 | -0.008 |
| -2.858999999999938 | 18.368 | 1.812 | -0.008 |
| -2.855999999999938 | 18.26 | 1.791 | -0.009 |
| -2.852999999999938 | 18.152 | 1.771 | -0.009 |
| -2.849999999999937 | 18.045 | 1.75 | -0.01 |
| -2.846999999999937 | 17.939 | 1.73 | -0.01 |
| -2.843999999999937 | 17.833 | 1.71 | -0.011 |
| -2.840999999999937 | 17.727 | 1.69 | -0.011 |
| -2.837999999999937 | 17.622 | 1.67 | -0.012 |
| -2.834999999999937 | 17.517 | 1.65 | -0.013 |
| -2.831999999999937 | 17.413 | 1.631 | -0.013 |
| -2.828999999999937 | 17.309 | 1.612 | -0.014 |
| -2.825999999999937 | 17.206 | 1.593 | -0.015 |
| -2.822999999999936 | 17.103 | 1.574 | -0.016 |
| -2.819999999999936 | 17.001 | 1.555 | -0.016 |
| -2.816999999999936 | 16.899 | 1.536 | -0.017 |
| -2.813999999999936 | 16.797 | 1.518 | -0.018 |
| -2.810999999999936 | 16.696 | 1.499 | -0.019 |
| -2.807999999999936 | 16.596 | 1.481 | -0.02 |
| -2.804999999999936 | 16.495 | 1.463 | -0.021 |
| -2.801999999999936 | 16.396 | 1.445 | -0.022 |
| -2.798999999999935 | 16.297 | 1.428 | -0.023 |
| -2.795999999999935 | 16.198 | 1.41 | -0.024 |
| -2.792999999999935 | 16.099 | 1.393 | -0.025 |
| -2.789999999999935 | 16.002 | 1.376 | -0.026 |
| -2.786999999999935 | 15.904 | 1.359 | -0.027 |
| -2.783999999999935 | 15.807 | 1.342 | -0.028 |
| -2.780999999999935 | 15.711 | 1.325 | -0.029 |
| -2.777999999999935 | 15.614 | 1.308 | -0.03 |
| -2.774999999999935 | 15.519 | 1.292 | -0.032 |
| -2.771999999999934 | 15.424 | 1.275 | -0.033 |
| -2.768999999999934 | 15.329 | 1.259 | -0.034 |
| -2.765999999999934 | 15.234 | 1.243 | -0.035 |
| -2.762999999999934 | 15.14 | 1.227 | -0.037 |
| -2.759999999999934 | 15.047 | 1.212 | -0.038 |
| -2.756999999999934 | 14.954 | 1.196 | -0.04 |
| -2.753999999999934 | 14.861 | 1.181 | -0.041 |
| -2.750999999999934 | 14.769 | 1.165 | -0.042 |
| -2.747999999999933 | 14.677 | 1.15 | -0.044 |
| -2.744999999999933 | 14.586 | 1.135 | -0.046 |
| -2.741999999999933 | 14.495 | 1.12 | -0.047 |
| -2.738999999999933 | 14.404 | 1.105 | -0.049 |
| -2.735999999999933 | 14.314 | 1.091 | -0.05 |
| -2.732999999999933 | 14.224 | 1.076 | -0.052 |
| -2.729999999999933 | 14.135 | 1.062 | -0.054 |
| -2.726999999999933 | 14.046 | 1.048 | -0.055 |
| -2.723999999999932 | 13.958 | 1.034 | -0.057 |
| -2.720999999999932 | 13.87 | 1.02 | -0.059 |
| -2.717999999999932 | 13.782 | 1.006 | -0.061 |
| -2.714999999999932 | 13.695 | 0.992 | -0.063 |
| -2.711999999999932 | 13.608 | 0.979 | -0.065 |
| -2.708999999999932 | 13.522 | 0.965 | -0.067 |
| -2.705999999999932 | 13.436 | 0.952 | -0.069 |
| -2.702999999999932 | 13.35 | 0.939 | -0.071 |
| -2.699999999999932 | 13.265 | 0.926 | -0.073 |
| -2.696999999999932 | 13.18 | 0.913 | -0.075 |
| -2.693999999999931 | 13.096 | 0.9 | -0.077 |
| -2.690999999999931 | 13.012 | 0.888 | -0.079 |
| -2.687999999999931 | 12.928 | 0.875 | -0.082 |
| -2.684999999999931 | 12.845 | 0.863 | -0.084 |
| -2.681999999999931 | 12.763 | 0.851 | -0.086 |
| -2.678999999999931 | 12.68 | 0.839 | -0.089 |
| -2.675999999999931 | 12.598 | 0.827 | -0.091 |
| -2.672999999999931 | 12.517 | 0.815 | -0.093 |
| -2.669999999999931 | 12.435 | 0.803 | -0.096 |
| -2.66699999999993 | 12.355 | 0.791 | -0.098 |
| -2.66399999999993 | 12.274 | 0.78 | -0.101 |
| -2.66099999999993 | 12.194 | 0.769 | -0.104 |
| -2.65799999999993 | 12.115 | 0.757 | -0.106 |
| -2.65499999999993 | 12.035 | 0.746 | -0.109 |
| -2.65199999999993 | 11.956 | 0.735 | -0.112 |
| -2.64899999999993 | 11.878 | 0.724 | -0.115 |
| -2.64599999999993 | 11.8 | 0.713 | -0.117 |
| -2.64299999999993 | 11.722 | 0.703 | -0.12 |
| -2.639999999999929 | 11.645 | 0.692 | -0.123 |
| -2.636999999999929 | 11.568 | 0.682 | -0.126 |
| -2.633999999999929 | 11.491 | 0.671 | -0.129 |
| -2.630999999999929 | 11.415 | 0.661 | -0.132 |
| -2.627999999999929 | 11.339 | 0.651 | -0.135 |
| -2.624999999999929 | 11.264 | 0.641 | -0.138 |
| -2.621999999999929 | 11.189 | 0.631 | -0.142 |
| -2.618999999999929 | 11.114 | 0.621 | -0.145 |
| -2.615999999999929 | 11.04 | 0.611 | -0.148 |
| -2.612999999999928 | 10.966 | 0.602 | -0.151 |
| -2.609999999999928 | 10.892 | 0.592 | -0.155 |
| -2.606999999999928 | 10.819 | 0.583 | -0.158 |
| -2.603999999999928 | 10.746 | 0.574 | -0.162 |
| -2.600999999999928 | 10.674 | 0.565 | -0.165 |
| -2.597999999999928 | 10.602 | 0.556 | -0.169 |
| -2.594999999999928 | 10.53 | 0.547 | -0.172 |
| -2.591999999999928 | 10.458 | 0.538 | -0.176 |
| -2.588999999999928 | 10.387 | 0.529 | -0.18 |
| -2.585999999999927 | 10.317 | 0.52 | -0.183 |
| -2.582999999999927 | 10.246 | 0.512 | -0.187 |
| -2.579999999999927 | 10.176 | 0.503 | -0.191 |
| -2.576999999999927 | 10.107 | 0.495 | -0.195 |
| -2.573999999999927 | 10.037 | 0.487 | -0.199 |
| -2.570999999999927 | 9.969 | 0.479 | -0.203 |
| -2.567999999999927 | 9.9 | 0.471 | -0.207 |
| -2.564999999999927 | 9.832 | 0.463 | -0.211 |
| -2.561999999999927 | 9.764 | 0.455 | -0.215 |
| -2.558999999999926 | 9.696 | 0.447 | -0.219 |
| -2.555999999999926 | 9.629 | 0.439 | -0.224 |
| -2.552999999999926 | 9.562 | 0.432 | -0.228 |
| -2.549999999999926 | 9.496 | 0.424 | -0.232 |
| -2.546999999999926 | 9.43 | 0.417 | -0.237 |
| -2.543999999999926 | 9.364 | 0.41 | -0.241 |
| -2.540999999999926 | 9.298 | 0.402 | -0.246 |
| -2.537999999999926 | 9.233 | 0.395 | -0.25 |
| -2.534999999999926 | 9.169 | 0.388 | -0.255 |
| -2.531999999999925 | 9.104 | 0.381 | -0.26 |
| -2.528999999999925 | 9.04 | 0.374 | -0.264 |
| -2.525999999999925 | 8.976 | 0.368 | -0.269 |
| -2.522999999999925 | 8.913 | 0.361 | -0.274 |
| -2.519999999999925 | 8.85 | 0.354 | -0.279 |
| -2.516999999999925 | 8.787 | 0.348 | -0.284 |
| -2.513999999999925 | 8.725 | 0.341 | -0.289 |
| -2.510999999999925 | 8.662 | 0.335 | -0.294 |
| -2.507999999999925 | 8.601 | 0.329 | -0.299 |
| -2.504999999999924 | 8.539 | 0.323 | -0.304 |
| -2.501999999999924 | 8.478 | 0.317 | -0.309 |
| -2.498999999999924 | 8.417 | 0.311 | -0.314 |
| -2.495999999999924 | 8.357 | 0.305 | -0.32 |
| -2.492999999999924 | 8.297 | 0.299 | -0.325 |
| -2.489999999999924 | 8.237 | 0.293 | -0.33 |
| -2.486999999999924 | 8.177 | 0.287 | -0.336 |
| -2.483999999999924 | 8.118 | 0.282 | -0.341 |
| -2.480999999999923 | 8.059 | 0.276 | -0.347 |
| -2.477999999999923 | 8.001 | 0.271 | -0.352 |
| -2.474999999999923 | 7.942 | 0.265 | -0.358 |
| -2.471999999999923 | 7.884 | 0.26 | -0.364 |
| -2.468999999999923 | 7.827 | 0.255 | -0.37 |
| -2.465999999999923 | 7.77 | 0.25 | -0.376 |
| -2.462999999999923 | 7.713 | 0.244 | -0.381 |
| -2.459999999999923 | 7.656 | 0.239 | -0.387 |
| -2.456999999999923 | 7.599 | 0.235 | -0.393 |
| -2.453999999999922 | 7.543 | 0.23 | -0.399 |
| -2.450999999999922 | 7.488 | 0.225 | -0.406 |
| -2.447999999999922 | 7.432 | 0.22 | -0.412 |
| -2.444999999999922 | 7.377 | 0.215 | -0.418 |
| -2.441999999999922 | 7.322 | 0.211 | -0.424 |
| -2.438999999999922 | 7.268 | 0.206 | -0.431 |
| -2.435999999999922 | 7.213 | 0.202 | -0.437 |
| -2.432999999999922 | 7.159 | 0.198 | -0.443 |
| -2.429999999999922 | 7.106 | 0.193 | -0.45 |
| -2.426999999999921 | 7.052 | 0.189 | -0.457 |
| -2.423999999999921 | 6.999 | 0.185 | -0.463 |
| -2.420999999999921 | 6.947 | 0.181 | -0.47 |
| -2.417999999999921 | 6.894 | 0.177 | -0.477 |
| -2.414999999999921 | 6.842 | 0.173 | -0.483 |
| -2.411999999999921 | 6.79 | 0.169 | -0.49 |
| -2.408999999999921 | 6.739 | 0.165 | -0.497 |
| -2.405999999999921 | 6.687 | 0.161 | -0.504 |
| -2.402999999999921 | 6.636 | 0.157 | -0.511 |
| -2.39999999999992 | 6.586 | 0.154 | -0.518 |
| -2.39699999999992 | 6.535 | 0.15 | -0.526 |
| -2.39399999999992 | 6.485 | 0.146 | -0.533 |
| -2.39099999999992 | 6.435 | 0.143 | -0.54 |
| -2.38799999999992 | 6.386 | 0.139 | -0.547 |
| -2.38499999999992 | 6.336 | 0.136 | -0.555 |
| -2.38199999999992 | 6.287 | 0.133 | -0.562 |
| -2.37899999999992 | 6.239 | 0.13 | -0.57 |
| -2.375999999999919 | 6.19 | 0.126 | -0.577 |
| -2.372999999999919 | 6.142 | 0.123 | -0.585 |
| -2.369999999999919 | 6.094 | 0.12 | -0.593 |
| -2.366999999999919 | 6.046 | 0.117 | -0.6 |
| -2.363999999999919 | 5.999 | 0.114 | -0.608 |
| -2.360999999999919 | 5.952 | 0.111 | -0.616 |
| -2.357999999999919 | 5.905 | 0.108 | -0.624 |
| -2.354999999999919 | 5.859 | 0.105 | -0.632 |
| -2.351999999999919 | 5.813 | 0.103 | -0.64 |
| -2.348999999999918 | 5.767 | 0.1 | -0.648 |
| -2.345999999999918 | 5.721 | 0.097 | -0.656 |
| -2.342999999999918 | 5.675 | 0.095 | -0.664 |
| -2.339999999999918 | 5.63 | 0.092 | -0.673 |
| -2.336999999999918 | 5.585 | 0.089 | -0.681 |
| -2.333999999999918 | 5.541 | 0.087 | -0.689 |
| -2.330999999999918 | 5.496 | 0.085 | -0.698 |
| -2.327999999999918 | 5.452 | 0.082 | -0.706 |
| -2.324999999999918 | 5.408 | 0.08 | -0.715 |
| -2.321999999999917 | 5.365 | 0.078 | -0.724 |
| -2.318999999999917 | 5.322 | 0.075 | -0.732 |
| -2.315999999999917 | 5.278 | 0.073 | -0.741 |
| -2.312999999999917 | 5.236 | 0.071 | -0.75 |
| -2.309999999999917 | 5.193 | 0.069 | -0.759 |
| -2.306999999999917 | 5.151 | 0.067 | -0.768 |
| -2.303999999999917 | 5.109 | 0.065 | -0.777 |
| -2.300999999999917 | 5.067 | 0.063 | -0.786 |
| -2.297999999999916 | 5.025 | 0.061 | -0.795 |
| -2.294999999999916 | 4.984 | 0.059 | -0.804 |
| -2.291999999999916 | 4.943 | 0.057 | -0.813 |
| -2.288999999999916 | 4.902 | 0.055 | -0.823 |
| -2.285999999999916 | 4.862 | 0.053 | -0.832 |
| -2.282999999999916 | 4.822 | 0.052 | -0.842 |
| -2.279999999999916 | 4.782 | 0.05 | -0.851 |
| -2.276999999999916 | 4.742 | 0.048 | -0.861 |
| -2.273999999999916 | 4.702 | 0.047 | -0.87 |
| -2.270999999999916 | 4.663 | 0.045 | -0.88 |
| -2.267999999999915 | 4.624 | 0.044 | -0.89 |
| -2.264999999999915 | 4.585 | 0.042 | -0.899 |
| -2.261999999999915 | 4.546 | 0.041 | -0.909 |
| -2.258999999999915 | 4.508 | 0.039 | -0.919 |
| -2.255999999999915 | 4.47 | 0.038 | -0.929 |
| -2.252999999999915 | 4.432 | 0.036 | -0.939 |
| -2.249999999999915 | 4.395 | 0.035 | -0.949 |
| -2.246999999999915 | 4.357 | 0.034 | -0.959 |
| -2.243999999999914 | 4.32 | 0.033 | -0.97 |
| -2.240999999999914 | 4.283 | 0.031 | -0.98 |
| -2.237999999999914 | 4.246 | 0.03 | -0.99 |
| -2.234999999999914 | 4.21 | 0.029 | -1.001 |
| -2.231999999999914 | 4.174 | 0.028 | -1.011 |
| -2.228999999999914 | 4.138 | 0.027 | -1.022 |
| -2.225999999999914 | 4.102 | 0.026 | -1.032 |
| -2.222999999999914 | 4.066 | 0.025 | -1.043 |
| -2.219999999999914 | 4.031 | 0.024 | -1.054 |
| -2.216999999999913 | 3.996 | 0.023 | -1.064 |
| -2.213999999999913 | 3.961 | 0.022 | -1.075 |
| -2.210999999999913 | 3.927 | 0.021 | -1.086 |
| -2.207999999999913 | 3.892 | 0.02 | -1.097 |
| -2.204999999999913 | 3.858 | 0.019 | -1.108 |
| -2.201999999999913 | 3.824 | 0.018 | -1.119 |
| -2.198999999999913 | 3.79 | 0.017 | -1.13 |
| -2.195999999999913 | 3.757 | 0.017 | -1.141 |
| -2.192999999999913 | 3.724 | 0.016 | -1.153 |
| -2.189999999999912 | 3.69 | 0.015 | -1.164 |
| -2.186999999999912 | 3.658 | 0.014 | -1.175 |
| -2.183999999999912 | 3.625 | 0.014 | -1.187 |
| -2.180999999999912 | 3.593 | 0.013 | -1.198 |
| -2.177999999999912 | 3.56 | 0.012 | -1.21 |
| -2.174999999999912 | 3.528 | 0.012 | -1.221 |
| -2.171999999999912 | 3.497 | 0.011 | -1.233 |
| -2.168999999999912 | 3.465 | 0.01 | -1.245 |
| -2.165999999999912 | 3.434 | 0.01 | -1.256 |
| -2.162999999999911 | 3.402 | 0.009 | -1.268 |
| -2.159999999999911 | 3.372 | 0.009 | -1.28 |
| -2.156999999999911 | 3.341 | 0.008 | -1.292 |
| -2.153999999999911 | 3.31 | 0.008 | -1.304 |
| -2.150999999999911 | 3.28 | 0.007 | -1.316 |
| -2.147999999999911 | 3.25 | 0.007 | -1.328 |
| -2.144999999999911 | 3.22 | 0.007 | -1.341 |
| -2.141999999999911 | 3.19 | 0.006 | -1.353 |
| -2.138999999999911 | 3.161 | 0.006 | -1.365 |
| -2.13599999999991 | 3.131 | 0.005 | -1.378 |
| -2.13299999999991 | 3.102 | 0.005 | -1.39 |
| -2.12999999999991 | 3.073 | 0.005 | -1.403 |
| -2.12699999999991 | 3.045 | 0.004 | -1.415 |
| -2.12399999999991 | 3.016 | 0.004 | -1.428 |
| -2.12099999999991 | 2.988 | 0.004 | -1.44 |
| -2.11799999999991 | 2.96 | 0.003 | -1.453 |
| -2.11499999999991 | 2.932 | 0.003 | -1.466 |
| -2.111999999999909 | 2.904 | 0.003 | -1.479 |
| -2.108999999999909 | 2.877 | 0.003 | -1.492 |
| -2.105999999999909 | 2.849 | 0.003 | -1.505 |
| -2.102999999999909 | 2.822 | 0.002 | -1.518 |
| -2.099999999999909 | 2.795 | 0.002 | -1.531 |
| -2.096999999999909 | 2.768 | 0.002 | -1.544 |
| -2.093999999999909 | 2.742 | 0.002 | -1.557 |
| -2.090999999999909 | 2.715 | 0.002 | -1.571 |
| -2.087999999999909 | 2.689 | 0.001 | -1.584 |
| -2.084999999999908 | 2.663 | 0.001 | -1.597 |
| -2.081999999999908 | 2.637 | 0.001 | -1.611 |
| -2.078999999999908 | 2.612 | 0.001 | -1.624 |
| -2.075999999999908 | 2.586 | 0.001 | -1.638 |
| -2.072999999999908 | 2.561 | 0.001 | -1.651 |
| -2.069999999999908 | 2.536 | 0.001 | -1.665 |
| -2.066999999999908 | 2.511 | 0.001 | -1.679 |
| -2.063999999999908 | 2.486 | 0.001 | -1.693 |
| -2.060999999999908 | 2.462 | 0 | -1.706 |
| -2.057999999999907 | 2.437 | 0 | -1.72 |
| -2.054999999999907 | 2.413 | 0 | -1.734 |
| -2.051999999999907 | 2.389 | 0 | -1.748 |
| -2.048999999999907 | 2.365 | 0 | -1.762 |
| -2.045999999999907 | 2.342 | 0 | -1.776 |
| -2.042999999999907 | 2.318 | 0 | -1.791 |
| -2.039999999999907 | 2.295 | 0 | -1.805 |
| -2.036999999999907 | 2.272 | 0 | -1.819 |
| -2.033999999999907 | 2.249 | 0 | -1.834 |
| -2.030999999999906 | 2.226 | 0 | -1.848 |
| -2.027999999999906 | 2.203 | 0 | -1.862 |
| -2.024999999999906 | 2.181 | 0 | -1.877 |
| -2.021999999999906 | 2.158 | 0 | -1.891 |
| -2.018999999999906 | 2.136 | 0 | -1.906 |
| -2.015999999999906 | 2.114 | 0 | -1.921 |
| -2.012999999999906 | 2.093 | 0 | -1.936 |
| -2.009999999999906 | 2.071 | 0 | -1.95 |
| -2.006999999999906 | 2.049 | 0 | -1.965 |
| -2.003999999999905 | 2.028 | 0 | -1.98 |
| -2.000999999999905 | 2.007 | 0 | -1.995 |
| -1.997999999999905 | 1.986 | 0 | -2.01 |
| -1.994999999999905 | 1.965 | 0 | -2.025 |
| -1.991999999999906 | 1.945 | 0 | -2.04 |
| -1.988999999999906 | 1.924 | 0 | -2.055 |
| -1.985999999999906 | 1.904 | 0 | -2.071 |
| -1.982999999999906 | 1.884 | 0 | -2.086 |
| -1.979999999999906 | 1.864 | 0 | -2.101 |
| -1.976999999999906 | 1.844 | 0 | -2.117 |
| -1.973999999999906 | 1.824 | 0 | -2.132 |
| -1.970999999999906 | 1.804 | 0 | -2.147 |
| -1.967999999999906 | 1.785 | 0 | -2.163 |
| -1.964999999999907 | 1.766 | 0 | -2.179 |
| -1.961999999999907 | 1.747 | 0 | -2.194 |
| -1.958999999999907 | 1.728 | 0 | -2.21 |
| -1.955999999999907 | 1.709 | 0 | -2.226 |
| -1.952999999999907 | 1.69 | 0 | -2.242 |
| -1.949999999999907 | 1.672 | 0 | -2.257 |
| -1.946999999999907 | 1.654 | 0 | -2.273 |
| -1.943999999999907 | 1.635 | 0 | -2.289 |
| -1.940999999999907 | 1.617 | 0 | -2.305 |
| -1.937999999999908 | 1.599 | 0 | -2.321 |
| -1.934999999999908 | 1.582 | -0.001 | -2.337 |
| -1.931999999999908 | 1.564 | -0.001 | -2.354 |
| -1.928999999999908 | 1.547 | -0.001 | -2.37 |
| -1.925999999999908 | 1.529 | -0.001 | -2.386 |
| -1.922999999999908 | 1.512 | -0.001 | -2.402 |
| -1.919999999999908 | 1.495 | -0.001 | -2.419 |
| -1.916999999999908 | 1.478 | -0.001 | -2.435 |
| -1.913999999999908 | 1.461 | -0.001 | -2.451 |
| -1.910999999999909 | 1.445 | -0.001 | -2.468 |
| -1.907999999999909 | 1.428 | -0.001 | -2.485 |
| -1.904999999999909 | 1.412 | -0.002 | -2.501 |
| -1.901999999999909 | 1.396 | -0.002 | -2.518 |
| -1.898999999999909 | 1.38 | -0.002 | -2.534 |
| -1.895999999999909 | 1.364 | -0.002 | -2.551 |
| -1.892999999999909 | 1.348 | -0.002 | -2.568 |
| -1.889999999999909 | 1.332 | -0.003 | -2.585 |
| -1.886999999999909 | 1.317 | -0.003 | -2.602 |
| -1.883999999999909 | 1.301 | -0.003 | -2.619 |
| -1.88099999999991 | 1.286 | -0.003 | -2.636 |
| -1.87799999999991 | 1.271 | -0.003 | -2.653 |
| -1.87499999999991 | 1.256 | -0.004 | -2.67 |
| -1.87199999999991 | 1.241 | -0.004 | -2.687 |
| -1.86899999999991 | 1.227 | -0.004 | -2.704 |
| -1.86599999999991 | 1.212 | -0.004 | -2.721 |
| -1.86299999999991 | 1.197 | -0.005 | -2.738 |
| -1.85999999999991 | 1.183 | -0.005 | -2.756 |
| -1.85699999999991 | 1.169 | -0.005 | -2.773 |
| -1.853999999999911 | 1.155 | -0.006 | -2.79 |
| -1.850999999999911 | 1.141 | -0.006 | -2.808 |
| -1.847999999999911 | 1.127 | -0.006 | -2.825 |
| -1.844999999999911 | 1.113 | -0.007 | -2.843 |
| -1.841999999999911 | 1.1 | -0.007 | -2.86 |
| -1.838999999999911 | 1.086 | -0.008 | -2.878 |
| -1.835999999999911 | 1.073 | -0.008 | -2.896 |
| -1.832999999999911 | 1.059 | -0.009 | -2.913 |
| -1.829999999999911 | 1.046 | -0.009 | -2.931 |
| -1.826999999999912 | 1.033 | -0.009 | -2.949 |
| -1.823999999999912 | 1.02 | -0.01 | -2.967 |
| -1.820999999999912 | 1.008 | -0.01 | -2.984 |
| -1.817999999999912 | 0.995 | -0.011 | -3.002 |
| -1.814999999999912 | 0.983 | -0.011 | -3.02 |
| -1.811999999999912 | 0.97 | -0.012 | -3.038 |
| -1.808999999999912 | 0.958 | -0.013 | -3.056 |
| -1.805999999999912 | 0.946 | -0.013 | -3.074 |
| -1.802999999999912 | 0.934 | -0.014 | -3.092 |
| -1.799999999999912 | 0.922 | -0.014 | -3.11 |
| -1.796999999999913 | 0.91 | -0.015 | -3.129 |
| -1.793999999999913 | 0.898 | -0.016 | -3.147 |
| -1.790999999999913 | 0.886 | -0.016 | -3.165 |
| -1.787999999999913 | 0.875 | -0.017 | -3.183 |
| -1.784999999999913 | 0.863 | -0.018 | -3.202 |
| -1.781999999999913 | 0.852 | -0.018 | -3.22 |
| -1.778999999999913 | 0.841 | -0.019 | -3.238 |
| -1.775999999999913 | 0.83 | -0.02 | -3.257 |
| -1.772999999999913 | 0.819 | -0.021 | -3.275 |
| -1.769999999999914 | 0.808 | -0.022 | -3.294 |
| -1.766999999999914 | 0.797 | -0.022 | -3.312 |
| -1.763999999999914 | 0.787 | -0.023 | -3.331 |
| -1.760999999999914 | 0.776 | -0.024 | -3.349 |
| -1.757999999999914 | 0.766 | -0.025 | -3.368 |
| -1.754999999999914 | 0.755 | -0.026 | -3.387 |
| -1.751999999999914 | 0.745 | -0.027 | -3.405 |
| -1.748999999999914 | 0.735 | -0.028 | -3.424 |
| -1.745999999999914 | 0.725 | -0.029 | -3.443 |
| -1.742999999999915 | 0.715 | -0.03 | -3.462 |
| -1.739999999999915 | 0.705 | -0.031 | -3.481 |
| -1.736999999999915 | 0.695 | -0.032 | -3.5 |
| -1.733999999999915 | 0.686 | -0.033 | -3.518 |
| -1.730999999999915 | 0.676 | -0.034 | -3.537 |
| -1.727999999999915 | 0.667 | -0.035 | -3.556 |
| -1.724999999999915 | 0.657 | -0.036 | -3.575 |
| -1.721999999999915 | 0.648 | -0.037 | -3.594 |
| -1.718999999999915 | 0.639 | -0.038 | -3.613 |
| -1.715999999999916 | 0.63 | -0.039 | -3.633 |
| -1.712999999999916 | 0.621 | -0.04 | -3.652 |
| -1.709999999999916 | 0.612 | -0.042 | -3.671 |
| -1.706999999999916 | 0.603 | -0.043 | -3.69 |
| -1.703999999999916 | 0.595 | -0.044 | -3.709 |
| -1.700999999999916 | 0.586 | -0.045 | -3.728 |
| -1.697999999999916 | 0.577 | -0.047 | -3.748 |
| -1.694999999999916 | 0.569 | -0.048 | -3.767 |
| -1.691999999999916 | 0.561 | -0.049 | -3.786 |
| -1.688999999999916 | 0.552 | -0.051 | -3.806 |
| -1.685999999999917 | 0.544 | -0.052 | -3.825 |
| -1.682999999999917 | 0.536 | -0.054 | -3.845 |
| -1.679999999999917 | 0.528 | -0.055 | -3.864 |
| -1.676999999999917 | 0.52 | -0.057 | -3.883 |
| -1.673999999999917 | 0.513 | -0.058 | -3.903 |
| -1.670999999999917 | 0.505 | -0.06 | -3.922 |
| -1.667999999999917 | 0.497 | -0.061 | -3.942 |
| -1.664999999999917 | 0.49 | -0.063 | -3.961 |
| -1.661999999999917 | 0.482 | -0.064 | -3.981 |
| -1.658999999999918 | 0.475 | -0.066 | -4.001 |
| -1.655999999999918 | 0.467 | -0.067 | -4.02 |
| -1.652999999999918 | 0.46 | -0.069 | -4.04 |
| -1.649999999999918 | 0.453 | -0.071 | -4.06 |
| -1.646999999999918 | 0.446 | -0.072 | -4.079 |
| -1.643999999999918 | 0.439 | -0.074 | -4.099 |
| -1.640999999999918 | 0.432 | -0.076 | -4.119 |
| -1.637999999999918 | 0.425 | -0.078 | -4.139 |
| -1.634999999999918 | 0.419 | -0.08 | -4.158 |
| -1.631999999999919 | 0.412 | -0.081 | -4.178 |
| -1.628999999999919 | 0.405 | -0.083 | -4.198 |
| -1.625999999999919 | 0.399 | -0.085 | -4.218 |
| -1.622999999999919 | 0.392 | -0.087 | -4.238 |
| -1.619999999999919 | 0.386 | -0.089 | -4.257 |
| -1.616999999999919 | 0.38 | -0.091 | -4.277 |
| -1.613999999999919 | 0.374 | -0.093 | -4.297 |
| -1.610999999999919 | 0.367 | -0.095 | -4.317 |
| -1.607999999999919 | 0.361 | -0.097 | -4.337 |
| -1.60499999999992 | 0.355 | -0.099 | -4.357 |
| -1.60199999999992 | 0.35 | -0.101 | -4.377 |
| -1.59899999999992 | 0.344 | -0.103 | -4.397 |
| -1.59599999999992 | 0.338 | -0.105 | -4.417 |
| -1.59299999999992 | 0.332 | -0.107 | -4.437 |
| -1.58999999999992 | 0.327 | -0.11 | -4.457 |
| -1.58699999999992 | 0.321 | -0.112 | -4.477 |
| -1.58399999999992 | 0.315 | -0.114 | -4.497 |
| -1.58099999999992 | 0.31 | -0.116 | -4.517 |
| -1.577999999999921 | 0.305 | -0.119 | -4.537 |
| -1.574999999999921 | 0.299 | -0.121 | -4.557 |
| -1.571999999999921 | 0.294 | -0.123 | -4.578 |
| -1.568999999999921 | 0.289 | -0.126 | -4.598 |
| -1.565999999999921 | 0.284 | -0.128 | -4.618 |
| -1.562999999999921 | 0.279 | -0.13 | -4.638 |
| -1.559999999999921 | 0.274 | -0.133 | -4.658 |
| -1.556999999999921 | 0.269 | -0.135 | -4.678 |
| -1.553999999999921 | 0.264 | -0.138 | -4.698 |
| -1.550999999999922 | 0.259 | -0.14 | -4.719 |
| -1.547999999999922 | 0.255 | -0.143 | -4.739 |
| -1.544999999999922 | 0.25 | -0.146 | -4.759 |
| -1.541999999999922 | 0.246 | -0.148 | -4.779 |
| -1.538999999999922 | 0.241 | -0.151 | -4.799 |
| -1.535999999999922 | 0.237 | -0.153 | -4.82 |
| -1.532999999999922 | 0.232 | -0.156 | -4.84 |
| -1.529999999999922 | 0.228 | -0.159 | -4.86 |
| -1.526999999999922 | 0.223 | -0.162 | -4.88 |
| -1.523999999999923 | 0.219 | -0.164 | -4.901 |
| -1.520999999999923 | 0.215 | -0.167 | -4.921 |
| -1.517999999999923 | 0.211 | -0.17 | -4.941 |
| -1.514999999999923 | 0.207 | -0.173 | -4.961 |
| -1.511999999999923 | 0.203 | -0.176 | -4.982 |
| -1.508999999999923 | 0.199 | -0.179 | -5.002 |
| -1.505999999999923 | 0.195 | -0.182 | -5.022 |
| -1.502999999999923 | 0.191 | -0.185 | -5.042 |
| -1.499999999999923 | 0.187 | -0.188 | -5.063 |
| -1.496999999999923 | 0.184 | -0.191 | -5.083 |
| -1.493999999999924 | 0.18 | -0.194 | -5.103 |
| -1.490999999999924 | 0.176 | -0.197 | -5.123 |
| -1.487999999999924 | 0.173 | -0.2 | -5.143 |
| -1.484999999999924 | 0.169 | -0.203 | -5.164 |
| -1.481999999999924 | 0.166 | -0.206 | -5.184 |
| -1.478999999999924 | 0.163 | -0.209 | -5.204 |
| -1.475999999999924 | 0.159 | -0.212 | -5.224 |
| -1.472999999999924 | 0.156 | -0.216 | -5.245 |
| -1.469999999999924 | 0.153 | -0.219 | -5.265 |
| -1.466999999999925 | 0.149 | -0.222 | -5.285 |
| -1.463999999999925 | 0.146 | -0.225 | -5.305 |
| -1.460999999999925 | 0.143 | -0.229 | -5.326 |
| -1.457999999999925 | 0.14 | -0.232 | -5.346 |
| -1.454999999999925 | 0.137 | -0.236 | -5.366 |
| -1.451999999999925 | 0.134 | -0.239 | -5.386 |
| -1.448999999999925 | 0.131 | -0.242 | -5.406 |
| -1.445999999999925 | 0.128 | -0.246 | -5.427 |
| -1.442999999999925 | 0.125 | -0.249 | -5.447 |
| -1.439999999999926 | 0.123 | -0.253 | -5.467 |
| -1.436999999999926 | 0.12 | -0.256 | -5.487 |
| -1.433999999999926 | 0.117 | -0.26 | -5.507 |
| -1.430999999999926 | 0.115 | -0.264 | -5.527 |
| -1.427999999999926 | 0.112 | -0.267 | -5.547 |
| -1.424999999999926 | 0.109 | -0.271 | -5.567 |
| -1.421999999999926 | 0.107 | -0.275 | -5.588 |
| -1.418999999999926 | 0.104 | -0.278 | -5.608 |
| -1.415999999999926 | 0.102 | -0.282 | -5.628 |
| -1.412999999999927 | 0.1 | -0.286 | -5.648 |
| -1.409999999999927 | 0.097 | -0.29 | -5.668 |
| -1.406999999999927 | 0.095 | -0.293 | -5.688 |
| -1.403999999999927 | 0.093 | -0.297 | -5.708 |
| -1.400999999999927 | 0.09 | -0.301 | -5.728 |
| -1.397999999999927 | 0.088 | -0.305 | -5.748 |
| -1.394999999999927 | 0.086 | -0.309 | -5.768 |
| -1.391999999999927 | 0.084 | -0.313 | -5.788 |
| -1.388999999999927 | 0.082 | -0.317 | -5.807 |
| -1.385999999999927 | 0.08 | -0.321 | -5.827 |
| -1.382999999999928 | 0.078 | -0.325 | -5.847 |
| -1.379999999999928 | 0.076 | -0.329 | -5.867 |
| -1.376999999999928 | 0.074 | -0.333 | -5.887 |
| -1.373999999999928 | 0.072 | -0.337 | -5.907 |
| -1.370999999999928 | 0.07 | -0.341 | -5.927 |
| -1.367999999999928 | 0.068 | -0.345 | -5.946 |
| -1.364999999999928 | 0.066 | -0.35 | -5.966 |
| -1.361999999999928 | 0.065 | -0.354 | -5.986 |
| -1.358999999999928 | 0.063 | -0.358 | -6.005 |
| -1.355999999999929 | 0.061 | -0.362 | -6.025 |
| -1.352999999999929 | 0.06 | -0.366 | -6.045 |
| -1.349999999999929 | 0.058 | -0.371 | -6.064 |
| -1.346999999999929 | 0.056 | -0.375 | -6.084 |
| -1.343999999999929 | 0.055 | -0.379 | -6.104 |
| -1.340999999999929 | 0.053 | -0.384 | -6.123 |
| -1.337999999999929 | 0.052 | -0.388 | -6.143 |
| -1.334999999999929 | 0.05 | -0.393 | -6.162 |
| -1.331999999999929 | 0.049 | -0.397 | -6.181 |
| -1.32899999999993 | 0.047 | -0.402 | -6.201 |
| -1.32599999999993 | 0.046 | -0.406 | -6.22 |
| -1.32299999999993 | 0.045 | -0.411 | -6.24 |
| -1.31999999999993 | 0.043 | -0.415 | -6.259 |
| -1.31699999999993 | 0.042 | -0.42 | -6.278 |
| -1.31399999999993 | 0.041 | -0.424 | -6.297 |
| -1.31099999999993 | 0.039 | -0.429 | -6.317 |
| -1.30799999999993 | 0.038 | -0.433 | -6.336 |
| -1.30499999999993 | 0.037 | -0.438 | -6.355 |
| -1.301999999999931 | 0.036 | -0.443 | -6.374 |
| -1.298999999999931 | 0.035 | -0.447 | -6.393 |
| -1.295999999999931 | 0.034 | -0.452 | -6.412 |
| -1.292999999999931 | 0.033 | -0.457 | -6.431 |
| -1.289999999999931 | 0.031 | -0.462 | -6.45 |
| -1.286999999999931 | 0.03 | -0.466 | -6.469 |
| -1.283999999999931 | 0.029 | -0.471 | -6.488 |
| -1.280999999999931 | 0.028 | -0.476 | -6.507 |
| -1.277999999999931 | 0.027 | -0.481 | -6.526 |
| -1.274999999999932 | 0.027 | -0.486 | -6.545 |
| -1.271999999999932 | 0.026 | -0.491 | -6.563 |
| -1.268999999999932 | 0.025 | -0.496 | -6.582 |
| -1.265999999999932 | 0.024 | -0.501 | -6.601 |
| -1.262999999999932 | 0.023 | -0.506 | -6.619 |
| -1.259999999999932 | 0.022 | -0.511 | -6.638 |
| -1.256999999999932 | 0.021 | -0.516 | -6.656 |
| -1.253999999999932 | 0.021 | -0.521 | -6.675 |
| -1.250999999999932 | 0.02 | -0.526 | -6.693 |
| -1.247999999999932 | 0.019 | -0.531 | -6.711 |
| -1.244999999999933 | 0.018 | -0.536 | -6.73 |
| -1.241999999999933 | 0.018 | -0.541 | -6.748 |
| -1.238999999999933 | 0.017 | -0.546 | -6.766 |
| -1.235999999999933 | 0.016 | -0.551 | -6.784 |
| -1.232999999999933 | 0.016 | -0.556 | -6.803 |
| -1.229999999999933 | 0.015 | -0.562 | -6.821 |
| -1.226999999999933 | 0.014 | -0.567 | -6.839 |
| -1.223999999999933 | 0.014 | -0.572 | -6.857 |
| -1.220999999999933 | 0.013 | -0.577 | -6.875 |
| -1.217999999999934 | 0.013 | -0.582 | -6.892 |
| -1.214999999999934 | 0.012 | -0.588 | -6.91 |
| -1.211999999999934 | 0.012 | -0.593 | -6.928 |
| -1.208999999999934 | 0.011 | -0.598 | -6.946 |
| -1.205999999999934 | 0.011 | -0.604 | -6.963 |
| -1.202999999999934 | 0.01 | -0.609 | -6.981 |
| -1.199999999999934 | 0.01 | -0.614 | -6.998 |
| -1.196999999999934 | 0.009 | -0.62 | -7.016 |
| -1.193999999999934 | 0.009 | -0.625 | -7.033 |
| -1.190999999999935 | 0.008 | -0.631 | -7.051 |
| -1.187999999999935 | 0.008 | -0.636 | -7.068 |
| -1.184999999999935 | 0.008 | -0.641 | -7.085 |
| -1.181999999999935 | 0.007 | -0.647 | -7.102 |
| -1.178999999999935 | 0.007 | -0.652 | -7.119 |
| -1.175999999999935 | 0.006 | -0.658 | -7.136 |
| -1.172999999999935 | 0.006 | -0.663 | -7.153 |
| -1.169999999999935 | 0.006 | -0.669 | -7.17 |
| -1.166999999999935 | 0.005 | -0.675 | -7.187 |
| -1.163999999999936 | 0.005 | -0.68 | -7.204 |
| -1.160999999999936 | 0.005 | -0.686 | -7.221 |
| -1.157999999999936 | 0.005 | -0.691 | -7.237 |
| -1.154999999999936 | 0.004 | -0.697 | -7.254 |
| -1.151999999999936 | 0.004 | -0.702 | -7.27 |
| -1.148999999999936 | 0.004 | -0.708 | -7.287 |
| -1.145999999999936 | 0.004 | -0.714 | -7.303 |
| -1.142999999999936 | 0.003 | -0.719 | -7.32 |
| -1.139999999999936 | 0.003 | -0.725 | -7.336 |
| -1.136999999999936 | 0.003 | -0.731 | -7.352 |
| -1.133999999999937 | 0.003 | -0.736 | -7.368 |
| -1.130999999999937 | 0.003 | -0.742 | -7.384 |
| -1.127999999999937 | 0.002 | -0.748 | -7.4 |
| -1.124999999999937 | 0.002 | -0.754 | -7.416 |
| -1.121999999999937 | 0.002 | -0.759 | -7.432 |
| -1.118999999999937 | 0.002 | -0.765 | -7.447 |
| -1.115999999999937 | 0.002 | -0.771 | -7.463 |
| -1.112999999999937 | 0.002 | -0.777 | -7.478 |
| -1.109999999999937 | 0.001 | -0.783 | -7.494 |
| -1.106999999999938 | 0.001 | -0.788 | -7.509 |
| -1.103999999999938 | 0.001 | -0.794 | -7.525 |
| -1.100999999999938 | 0.001 | -0.8 | -7.54 |
| -1.097999999999938 | 0.001 | -0.806 | -7.555 |
| -1.094999999999938 | 0.001 | -0.812 | -7.57 |
| -1.091999999999938 | 0.001 | -0.817 | -7.585 |
| -1.088999999999938 | 0.001 | -0.823 | -7.6 |
| -1.085999999999938 | 0.001 | -0.829 | -7.615 |
| -1.082999999999938 | 0.001 | -0.835 | -7.629 |
| -1.079999999999939 | 0.001 | -0.841 | -7.644 |
| -1.076999999999939 | 0 | -0.847 | -7.659 |
| -1.073999999999939 | 0 | -0.853 | -7.673 |
| -1.070999999999939 | 0 | -0.859 | -7.688 |
| -1.067999999999939 | 0 | -0.865 | -7.702 |
| -1.064999999999939 | 0 | -0.871 | -7.716 |
| -1.061999999999939 | 0 | -0.876 | -7.73 |
| -1.058999999999939 | 0 | -0.882 | -7.744 |
| -1.055999999999939 | 0 | -0.888 | -7.758 |
| -1.05299999999994 | 0 | -0.894 | -7.772 |
| -1.04999999999994 | 0 | -0.9 | -7.786 |
| -1.04699999999994 | 0 | -0.906 | -7.799 |
| -1.04399999999994 | 0 | -0.912 | -7.813 |
| -1.04099999999994 | 0 | -0.918 | -7.826 |
| -1.03799999999994 | 0 | -0.924 | -7.84 |
| -1.03499999999994 | 0 | -0.93 | -7.853 |
| -1.03199999999994 | 0 | -0.936 | -7.866 |
| -1.02899999999994 | 0 | -0.942 | -7.879 |
| -1.025999999999941 | 0 | -0.948 | -7.892 |
| -1.022999999999941 | 0 | -0.954 | -7.905 |
| -1.019999999999941 | 0 | -0.96 | -7.918 |
| -1.016999999999941 | 0 | -0.966 | -7.93 |
| -1.013999999999941 | 0 | -0.972 | -7.943 |
| -1.010999999999941 | 0 | -0.978 | -7.955 |
| -1.007999999999941 | 0 | -0.984 | -7.968 |
| -1.004999999999941 | 0 | -0.99 | -7.98 |
| -1.001999999999941 | 0 | -0.996 | -7.992 |
| -0.998999999999941 | 0 | -1.002 | -8.004 |
| -0.995999999999941 | 0 | -1.008 | -8.016 |
| -0.992999999999941 | 0 | -1.014 | -8.028 |
| -0.989999999999941 | 0 | -1.02 | -8.039 |
| -0.986999999999941 | 0 | -1.026 | -8.051 |
| -0.983999999999941 | 0 | -1.032 | -8.062 |
| -0.980999999999941 | 0 | -1.038 | -8.074 |
| -0.977999999999941 | 0 | -1.044 | -8.085 |
| -0.974999999999941 | 0 | -1.05 | -8.096 |
| -0.971999999999941 | 0 | -1.056 | -8.107 |
| -0.968999999999941 | 0 | -1.062 | -8.118 |
| -0.965999999999941 | 0 | -1.068 | -8.129 |
| -0.962999999999941 | 0 | -1.074 | -8.14 |
| -0.959999999999941 | 0 | -1.08 | -8.15 |
| -0.956999999999941 | 0 | -1.086 | -8.161 |
| -0.953999999999941 | 0 | -1.092 | -8.171 |
| -0.950999999999941 | 0 | -1.098 | -8.181 |
| -0.947999999999941 | 0 | -1.104 | -8.191 |
| -0.944999999999941 | 0 | -1.11 | -8.201 |
| -0.941999999999941 | 0 | -1.116 | -8.211 |
| -0.938999999999941 | 0 | -1.122 | -8.221 |
| -0.935999999999941 | 0 | -1.127 | -8.23 |
| -0.932999999999941 | 0 | -1.133 | -8.24 |
| -0.929999999999941 | 0 | -1.139 | -8.249 |
| -0.926999999999941 | 0 | -1.145 | -8.258 |
| -0.923999999999941 | 0 | -1.151 | -8.267 |
| -0.920999999999941 | 0 | -1.157 | -8.276 |
| -0.917999999999941 | -0.001 | -1.163 | -8.285 |
| -0.914999999999941 | -0.001 | -1.169 | -8.294 |
| -0.911999999999941 | -0.001 | -1.175 | -8.302 |
| -0.908999999999941 | -0.001 | -1.18 | -8.31 |
| -0.905999999999941 | -0.001 | -1.186 | -8.319 |
| -0.902999999999941 | -0.001 | -1.192 | -8.327 |
| -0.899999999999941 | -0.001 | -1.198 | -8.335 |
| -0.896999999999941 | -0.001 | -1.204 | -8.343 |
| -0.893999999999941 | -0.001 | -1.209 | -8.351 |
| -0.890999999999941 | -0.001 | -1.215 | -8.358 |
| -0.887999999999941 | -0.001 | -1.221 | -8.366 |
| -0.884999999999941 | -0.001 | -1.227 | -8.373 |
| -0.881999999999941 | -0.001 | -1.233 | -8.38 |
| -0.878999999999941 | -0.002 | -1.238 | -8.387 |
| -0.875999999999941 | -0.002 | -1.244 | -8.394 |
| -0.872999999999941 | -0.002 | -1.25 | -8.401 |
| -0.869999999999941 | -0.002 | -1.255 | -8.407 |
| -0.866999999999941 | -0.002 | -1.261 | -8.414 |
| -0.863999999999941 | -0.002 | -1.267 | -8.42 |
| -0.860999999999941 | -0.002 | -1.272 | -8.426 |
| -0.857999999999941 | -0.002 | -1.278 | -8.432 |
| -0.854999999999941 | -0.003 | -1.283 | -8.438 |
| -0.851999999999941 | -0.003 | -1.289 | -8.444 |
| -0.848999999999941 | -0.003 | -1.295 | -8.449 |
| -0.845999999999941 | -0.003 | -1.3 | -8.455 |
| -0.842999999999941 | -0.003 | -1.306 | -8.46 |
| -0.839999999999941 | -0.003 | -1.311 | -8.465 |
| -0.836999999999941 | -0.004 | -1.317 | -8.47 |
| -0.833999999999941 | -0.004 | -1.322 | -8.475 |
| -0.830999999999941 | -0.004 | -1.328 | -8.48 |
| -0.827999999999941 | -0.004 | -1.333 | -8.484 |
| -0.824999999999941 | -0.004 | -1.338 | -8.489 |
| -0.821999999999941 | -0.005 | -1.344 | -8.493 |
| -0.818999999999941 | -0.005 | -1.349 | -8.497 |
| -0.815999999999941 | -0.005 | -1.354 | -8.501 |
| -0.812999999999941 | -0.005 | -1.36 | -8.504 |
| -0.809999999999941 | -0.006 | -1.365 | -8.508 |
| -0.806999999999941 | -0.006 | -1.37 | -8.511 |
| -0.803999999999941 | -0.006 | -1.375 | -8.514 |
| -0.800999999999941 | -0.006 | -1.381 | -8.517 |
| -0.797999999999941 | -0.007 | -1.386 | -8.52 |
| -0.794999999999941 | -0.007 | -1.391 | -8.523 |
| -0.791999999999941 | -0.007 | -1.396 | -8.526 |
| -0.788999999999941 | -0.007 | -1.401 | -8.528 |
| -0.785999999999941 | -0.008 | -1.406 | -8.53 |
| -0.782999999999941 | -0.008 | -1.411 | -8.532 |
| -0.779999999999941 | -0.008 | -1.416 | -8.534 |
| -0.776999999999941 | -0.009 | -1.421 | -8.536 |
| -0.773999999999941 | -0.009 | -1.426 | -8.537 |
| -0.770999999999941 | -0.009 | -1.431 | -8.539 |
| -0.767999999999941 | -0.01 | -1.436 | -8.54 |
| -0.764999999999941 | -0.01 | -1.441 | -8.541 |
| -0.761999999999941 | -0.01 | -1.446 | -8.542 |
| -0.758999999999941 | -0.011 | -1.451 | -8.542 |
| -0.755999999999941 | -0.011 | -1.455 | -8.543 |
| -0.752999999999941 | -0.011 | -1.46 | -8.543 |
| -0.749999999999941 | -0.012 | -1.465 | -8.543 |
| -0.746999999999941 | -0.012 | -1.47 | -8.543 |
| -0.743999999999941 | -0.012 | -1.474 | -8.543 |
| -0.740999999999941 | -0.013 | -1.479 | -8.542 |
| -0.737999999999941 | -0.013 | -1.483 | -8.542 |
| -0.734999999999941 | -0.014 | -1.488 | -8.541 |
| -0.731999999999941 | -0.014 | -1.492 | -8.54 |
| -0.728999999999941 | -0.015 | -1.497 | -8.538 |
| -0.725999999999941 | -0.015 | -1.501 | -8.537 |
| -0.722999999999941 | -0.015 | -1.506 | -8.535 |
| -0.719999999999941 | -0.016 | -1.51 | -8.534 |
| -0.716999999999941 | -0.016 | -1.514 | -8.532 |
| -0.713999999999941 | -0.017 | -1.519 | -8.53 |
| -0.710999999999941 | -0.017 | -1.523 | -8.527 |
| -0.707999999999941 | -0.018 | -1.527 | -8.525 |
| -0.704999999999941 | -0.018 | -1.531 | -8.522 |
| -0.701999999999941 | -0.019 | -1.535 | -8.519 |
| -0.698999999999941 | -0.019 | -1.539 | -8.516 |
| -0.695999999999941 | -0.02 | -1.543 | -8.512 |
| -0.692999999999941 | -0.02 | -1.547 | -8.509 |
| -0.689999999999941 | -0.021 | -1.551 | -8.505 |
| -0.686999999999941 | -0.021 | -1.555 | -8.501 |
| -0.683999999999941 | -0.022 | -1.559 | -8.497 |
| -0.680999999999941 | -0.022 | -1.563 | -8.493 |
| -0.677999999999941 | -0.023 | -1.566 | -8.488 |
| -0.674999999999941 | -0.023 | -1.57 | -8.483 |
| -0.671999999999941 | -0.024 | -1.574 | -8.478 |
| -0.668999999999941 | -0.024 | -1.577 | -8.473 |
| -0.665999999999941 | -0.025 | -1.581 | -8.468 |
| -0.662999999999941 | -0.025 | -1.585 | -8.462 |
| -0.659999999999941 | -0.026 | -1.588 | -8.457 |
| -0.656999999999941 | -0.027 | -1.591 | -8.45 |
| -0.653999999999941 | -0.027 | -1.595 | -8.444 |
| -0.650999999999941 | -0.028 | -1.598 | -8.438 |
| -0.647999999999941 | -0.028 | -1.601 | -8.431 |
| -0.644999999999941 | -0.029 | -1.605 | -8.424 |
| -0.641999999999941 | -0.029 | -1.608 | -8.417 |
| -0.638999999999941 | -0.03 | -1.611 | -8.41 |
| -0.635999999999941 | -0.031 | -1.614 | -8.402 |
| -0.632999999999941 | -0.031 | -1.617 | -8.395 |
| -0.629999999999941 | -0.032 | -1.62 | -8.387 |
| -0.626999999999941 | -0.033 | -1.623 | -8.378 |
| -0.623999999999941 | -0.033 | -1.626 | -8.37 |
| -0.620999999999941 | -0.034 | -1.628 | -8.361 |
| -0.617999999999941 | -0.034 | -1.631 | -8.352 |
| -0.614999999999941 | -0.035 | -1.634 | -8.343 |
| -0.611999999999941 | -0.036 | -1.637 | -8.334 |
| -0.608999999999941 | -0.036 | -1.639 | -8.324 |
| -0.605999999999941 | -0.037 | -1.642 | -8.315 |
| -0.602999999999941 | -0.038 | -1.644 | -8.305 |
| -0.599999999999941 | -0.038 | -1.646 | -8.294 |
| -0.596999999999941 | -0.039 | -1.649 | -8.284 |
| -0.593999999999941 | -0.04 | -1.651 | -8.273 |
| -0.590999999999941 | -0.04 | -1.653 | -8.262 |
| -0.587999999999941 | -0.041 | -1.655 | -8.251 |
| -0.584999999999941 | -0.042 | -1.657 | -8.24 |
| -0.581999999999941 | -0.043 | -1.659 | -8.228 |
| -0.578999999999941 | -0.043 | -1.661 | -8.216 |
| -0.575999999999941 | -0.044 | -1.663 | -8.204 |
| -0.572999999999941 | -0.045 | -1.665 | -8.192 |
| -0.569999999999941 | -0.045 | -1.667 | -8.179 |
| -0.566999999999941 | -0.046 | -1.668 | -8.166 |
| -0.563999999999941 | -0.047 | -1.67 | -8.153 |
| -0.560999999999941 | -0.047 | -1.672 | -8.14 |
| -0.557999999999941 | -0.048 | -1.673 | -8.126 |
| -0.554999999999941 | -0.049 | -1.675 | -8.112 |
| -0.551999999999941 | -0.05 | -1.676 | -8.098 |
| -0.548999999999941 | -0.05 | -1.677 | -8.084 |
| -0.545999999999941 | -0.051 | -1.678 | -8.069 |
| -0.542999999999941 | -0.052 | -1.679 | -8.054 |
| -0.539999999999941 | -0.053 | -1.681 | -8.039 |
| -0.536999999999941 | -0.053 | -1.682 | -8.024 |
| -0.533999999999941 | -0.054 | -1.682 | -8.008 |
| -0.530999999999941 | -0.055 | -1.683 | -7.992 |
| -0.527999999999941 | -0.056 | -1.684 | -7.976 |
| -0.524999999999941 | -0.056 | -1.685 | -7.959 |
| -0.521999999999941 | -0.057 | -1.685 | -7.943 |
| -0.518999999999941 | -0.058 | -1.686 | -7.926 |
| -0.515999999999941 | -0.059 | -1.686 | -7.909 |
| -0.512999999999941 | -0.059 | -1.687 | -7.891 |
| -0.509999999999941 | -0.06 | -1.687 | -7.874 |
| -0.506999999999941 | -0.061 | -1.687 | -7.856 |
| -0.503999999999941 | -0.062 | -1.687 | -7.837 |
| -0.500999999999941 | -0.062 | -1.687 | -7.819 |
| -0.497999999999941 | -0.063 | -1.687 | -7.8 |
| -0.494999999999941 | -0.064 | -1.687 | -7.781 |
| -0.491999999999941 | -0.064 | -1.687 | -7.762 |
| -0.488999999999941 | -0.065 | -1.687 | -7.742 |
| -0.485999999999941 | -0.066 | -1.687 | -7.722 |
| -0.482999999999941 | -0.067 | -1.686 | -7.702 |
| -0.479999999999941 | -0.067 | -1.686 | -7.681 |
| -0.476999999999941 | -0.068 | -1.685 | -7.661 |
| -0.473999999999941 | -0.069 | -1.684 | -7.64 |
| -0.470999999999941 | -0.07 | -1.684 | -7.618 |
| -0.467999999999941 | -0.07 | -1.683 | -7.597 |
| -0.464999999999941 | -0.071 | -1.682 | -7.575 |
| -0.461999999999941 | -0.072 | -1.681 | -7.553 |
| -0.458999999999941 | -0.073 | -1.68 | -7.531 |
| -0.455999999999941 | -0.073 | -1.678 | -7.508 |
| -0.452999999999941 | -0.074 | -1.677 | -7.485 |
| -0.449999999999941 | -0.075 | -1.676 | -7.462 |
| -0.446999999999941 | -0.076 | -1.674 | -7.438 |
| -0.443999999999941 | -0.076 | -1.673 | -7.414 |
| -0.440999999999941 | -0.077 | -1.671 | -7.39 |
| -0.437999999999941 | -0.078 | -1.669 | -7.366 |
| -0.434999999999941 | -0.078 | -1.667 | -7.341 |
| -0.431999999999941 | -0.079 | -1.665 | -7.316 |
| -0.428999999999941 | -0.08 | -1.663 | -7.291 |
| -0.425999999999941 | -0.081 | -1.661 | -7.265 |
| -0.422999999999941 | -0.081 | -1.659 | -7.239 |
| -0.419999999999941 | -0.082 | -1.657 | -7.213 |
| -0.416999999999941 | -0.083 | -1.654 | -7.186 |
| -0.413999999999941 | -0.083 | -1.652 | -7.16 |
| -0.410999999999941 | -0.084 | -1.649 | -7.132 |
| -0.407999999999941 | -0.085 | -1.646 | -7.105 |
| -0.404999999999941 | -0.085 | -1.643 | -7.077 |
| -0.401999999999941 | -0.086 | -1.64 | -7.049 |
| -0.398999999999941 | -0.087 | -1.637 | -7.021 |
| -0.395999999999941 | -0.087 | -1.634 | -6.992 |
| -0.392999999999941 | -0.088 | -1.631 | -6.963 |
| -0.389999999999941 | -0.089 | -1.628 | -6.934 |
| -0.386999999999941 | -0.089 | -1.624 | -6.904 |
| -0.383999999999941 | -0.09 | -1.621 | -6.875 |
| -0.380999999999941 | -0.09 | -1.617 | -6.844 |
| -0.377999999999941 | -0.091 | -1.613 | -6.814 |
| -0.374999999999941 | -0.092 | -1.609 | -6.783 |
| -0.371999999999941 | -0.092 | -1.605 | -6.752 |
| -0.368999999999941 | -0.093 | -1.601 | -6.72 |
| -0.365999999999941 | -0.093 | -1.597 | -6.688 |
| -0.362999999999941 | -0.094 | -1.592 | -6.656 |
| -0.359999999999941 | -0.094 | -1.588 | -6.624 |
| -0.356999999999941 | -0.095 | -1.583 | -6.591 |
| -0.353999999999941 | -0.095 | -1.579 | -6.558 |
| -0.350999999999941 | -0.096 | -1.574 | -6.525 |
| -0.347999999999941 | -0.096 | -1.569 | -6.491 |
| -0.344999999999941 | -0.097 | -1.564 | -6.457 |
| -0.341999999999941 | -0.097 | -1.559 | -6.422 |
| -0.338999999999941 | -0.098 | -1.553 | -6.388 |
| -0.335999999999941 | -0.098 | -1.548 | -6.352 |
| -0.332999999999941 | -0.099 | -1.543 | -6.317 |
| -0.329999999999941 | -0.099 | -1.537 | -6.281 |
| -0.326999999999941 | -0.1 | -1.531 | -6.245 |
| -0.323999999999941 | -0.1 | -1.525 | -6.209 |
| -0.320999999999941 | -0.1 | -1.519 | -6.172 |
| -0.317999999999941 | -0.101 | -1.513 | -6.135 |
| -0.314999999999941 | -0.101 | -1.507 | -6.097 |
| -0.311999999999941 | -0.102 | -1.501 | -6.06 |
| -0.308999999999941 | -0.102 | -1.494 | -6.021 |
| -0.305999999999941 | -0.102 | -1.488 | -5.983 |
| -0.302999999999941 | -0.103 | -1.481 | -5.944 |
| -0.299999999999941 | -0.103 | -1.474 | -5.905 |
| -0.296999999999941 | -0.103 | -1.467 | -5.865 |
| -0.293999999999941 | -0.103 | -1.46 | -5.825 |
| -0.290999999999941 | -0.104 | -1.453 | -5.785 |
| -0.287999999999941 | -0.104 | -1.445 | -5.745 |
| -0.284999999999941 | -0.104 | -1.438 | -5.704 |
| -0.281999999999941 | -0.104 | -1.43 | -5.662 |
| -0.278999999999941 | -0.105 | -1.422 | -5.621 |
| -0.275999999999941 | -0.105 | -1.414 | -5.579 |
| -0.272999999999941 | -0.105 | -1.406 | -5.536 |
| -0.269999999999941 | -0.105 | -1.398 | -5.494 |
| -0.266999999999941 | -0.105 | -1.39 | -5.45 |
| -0.263999999999941 | -0.105 | -1.381 | -5.407 |
| -0.260999999999941 | -0.105 | -1.373 | -5.363 |
| -0.257999999999941 | -0.105 | -1.364 | -5.319 |
| -0.254999999999941 | -0.105 | -1.355 | -5.274 |
| -0.251999999999941 | -0.105 | -1.346 | -5.229 |
| -0.248999999999941 | -0.105 | -1.337 | -5.184 |
| -0.245999999999941 | -0.105 | -1.327 | -5.138 |
| -0.242999999999941 | -0.105 | -1.318 | -5.092 |
| -0.239999999999941 | -0.105 | -1.308 | -5.046 |
| -0.236999999999941 | -0.105 | -1.299 | -4.999 |
| -0.233999999999941 | -0.105 | -1.289 | -4.952 |
| -0.230999999999941 | -0.105 | -1.279 | -4.904 |
| -0.227999999999941 | -0.105 | -1.269 | -4.856 |
| -0.224999999999941 | -0.105 | -1.258 | -4.808 |
| -0.221999999999941 | -0.105 | -1.248 | -4.759 |
| -0.218999999999941 | -0.104 | -1.237 | -4.71 |
| -0.215999999999941 | -0.104 | -1.226 | -4.661 |
| -0.212999999999941 | -0.104 | -1.215 | -4.611 |
| -0.209999999999941 | -0.104 | -1.204 | -4.561 |
| -0.206999999999941 | -0.103 | -1.193 | -4.51 |
| -0.203999999999941 | -0.103 | -1.182 | -4.459 |
| -0.200999999999941 | -0.103 | -1.17 | -4.408 |
| -0.197999999999941 | -0.102 | -1.159 | -4.356 |
| -0.194999999999941 | -0.102 | -1.147 | -4.304 |
| -0.191999999999941 | -0.101 | -1.135 | -4.251 |
| -0.188999999999941 | -0.101 | -1.123 | -4.198 |
| -0.185999999999941 | -0.1 | -1.11 | -4.145 |
| -0.182999999999941 | -0.1 | -1.098 | -4.091 |
| -0.179999999999941 | -0.099 | -1.085 | -4.037 |
| -0.176999999999941 | -0.099 | -1.072 | -3.982 |
| -0.173999999999941 | -0.098 | -1.059 | -3.927 |
| -0.170999999999941 | -0.097 | -1.046 | -3.872 |
| -0.167999999999941 | -0.097 | -1.033 | -3.816 |
| -0.164999999999941 | -0.096 | -1.02 | -3.76 |
| -0.161999999999941 | -0.095 | -1.006 | -3.703 |
| -0.158999999999941 | -0.095 | -0.992 | -3.646 |
| -0.155999999999941 | -0.094 | -0.978 | -3.589 |
| -0.152999999999941 | -0.093 | -0.964 | -3.531 |
| -0.149999999999941 | -0.092 | -0.95 | -3.472 |
| -0.146999999999941 | -0.091 | -0.935 | -3.414 |
| -0.143999999999941 | -0.09 | -0.921 | -3.355 |
| -0.140999999999941 | -0.089 | -0.906 | -3.295 |
| -0.137999999999941 | -0.088 | -0.891 | -3.235 |
| -0.134999999999941 | -0.087 | -0.876 | -3.175 |
| -0.131999999999941 | -0.086 | -0.86 | -3.114 |
| -0.128999999999941 | -0.085 | -0.845 | -3.053 |
| -0.125999999999941 | -0.084 | -0.829 | -2.991 |
| -0.122999999999941 | -0.083 | -0.813 | -2.929 |
| -0.119999999999941 | -0.082 | -0.797 | -2.867 |
| -0.116999999999941 | -0.081 | -0.781 | -2.804 |
| -0.113999999999941 | -0.079 | -0.765 | -2.74 |
| -0.110999999999941 | -0.078 | -0.748 | -2.676 |
| -0.107999999999941 | -0.077 | -0.731 | -2.612 |
| -0.104999999999941 | -0.075 | -0.715 | -2.548 |
| -0.101999999999941 | -0.074 | -0.697 | -2.483 |
| -0.0989999999999406 | -0.072 | -0.68 | -2.417 |
| -0.0959999999999406 | -0.071 | -0.663 | -2.351 |
| -0.0929999999999405 | -0.069 | -0.645 | -2.285 |
| -0.0899999999999406 | -0.068 | -0.627 | -2.218 |
| -0.0869999999999406 | -0.066 | -0.609 | -2.151 |
| -0.0839999999999405 | -0.065 | -0.591 | -2.083 |
| -0.0809999999999405 | -0.063 | -0.572 | -2.015 |
| -0.0779999999999406 | -0.061 | -0.554 | -1.946 |
| -0.0749999999999406 | -0.059 | -0.535 | -1.877 |
| -0.0719999999999405 | -0.058 | -0.516 | -1.807 |
| -0.0689999999999405 | -0.056 | -0.497 | -1.737 |
| -0.0659999999999405 | -0.054 | -0.477 | -1.667 |
| -0.0629999999999405 | -0.052 | -0.458 | -1.596 |
| -0.0599999999999405 | -0.05 | -0.438 | -1.525 |
| -0.0569999999999405 | -0.048 | -0.418 | -1.453 |
| -0.0539999999999405 | -0.046 | -0.398 | -1.381 |
| -0.0509999999999405 | -0.044 | -0.378 | -1.308 |
| -0.0479999999999405 | -0.041 | -0.357 | -1.235 |
| -0.0449999999999405 | -0.039 | -0.336 | -1.161 |
| -0.0419999999999405 | -0.037 | -0.315 | -1.087 |
| -0.0389999999999405 | -0.035 | -0.294 | -1.012 |
| -0.0359999999999405 | -0.032 | -0.273 | -0.937 |
| -0.0329999999999405 | -0.03 | -0.251 | -0.862 |
| -0.0299999999999405 | -0.027 | -0.229 | -0.786 |
| -0.0269999999999405 | -0.025 | -0.207 | -0.709 |
| -0.0239999999999405 | -0.022 | -0.185 | -0.633 |
| -0.0209999999999405 | -0.02 | -0.163 | -0.555 |
| -0.0179999999999405 | -0.017 | -0.14 | -0.477 |
| -0.0149999999999405 | -0.014 | -0.117 | -0.399 |
| -0.0119999999999405 | -0.012 | -0.094 | -0.32 |
| -0.00899999999994053 | -0.009 | -0.071 | -0.241 |
| -0.00599999999994053 | -0.006 | -0.048 | -0.161 |
| -0.00299999999994053 | -0.003 | -0.024 | -0.081 |
| 5.94723922886509e-14 | 0 | 0 | 0 |
| 0.00300000000005947 | 0.003 | 0.024 | 0.081 |
| 0.00600000000005947 | 0.006 | 0.048 | 0.163 |
| 0.00900000000005947 | 0.009 | 0.073 | 0.245 |
| 0.0120000000000595 | 0.012 | 0.098 | 0.328 |
| 0.0150000000000595 | 0.016 | 0.123 | 0.411 |
| 0.0180000000000595 | 0.019 | 0.148 | 0.495 |
| 0.0210000000000595 | 0.022 | 0.173 | 0.579 |
| 0.0240000000000595 | 0.026 | 0.199 | 0.664 |
| 0.0270000000000595 | 0.029 | 0.225 | 0.749 |
| 0.0300000000000595 | 0.033 | 0.251 | 0.835 |
| 0.0330000000000595 | 0.036 | 0.277 | 0.921 |
| 0.0360000000000595 | 0.04 | 0.304 | 1.007 |
| 0.0390000000000595 | 0.044 | 0.331 | 1.095 |
| 0.0420000000000595 | 0.048 | 0.358 | 1.182 |
| 0.0450000000000595 | 0.051 | 0.385 | 1.27 |
| 0.0480000000000595 | 0.055 | 0.412 | 1.359 |
| 0.0510000000000595 | 0.059 | 0.44 | 1.448 |
| 0.0540000000000595 | 0.063 | 0.468 | 1.538 |
| 0.0570000000000595 | 0.067 | 0.496 | 1.628 |
| 0.0600000000000595 | 0.071 | 0.525 | 1.719 |
| 0.0630000000000595 | 0.076 | 0.553 | 1.81 |
| 0.0660000000000595 | 0.08 | 0.582 | 1.902 |
| 0.0690000000000595 | 0.084 | 0.611 | 1.995 |
| 0.0720000000000595 | 0.089 | 0.64 | 2.087 |
| 0.0750000000000595 | 0.093 | 0.67 | 2.181 |
| 0.0780000000000595 | 0.098 | 0.7 | 2.275 |
| 0.0810000000000595 | 0.102 | 0.73 | 2.369 |
| 0.0840000000000595 | 0.107 | 0.76 | 2.464 |
| 0.0870000000000595 | 0.112 | 0.791 | 2.559 |
| 0.0900000000000595 | 0.117 | 0.822 | 2.655 |
| 0.0930000000000595 | 0.121 | 0.853 | 2.752 |
| 0.0960000000000595 | 0.126 | 0.884 | 2.849 |
| 0.0990000000000595 | 0.131 | 0.916 | 2.946 |
| 0.10200000000006 | 0.137 | 0.947 | 3.045 |
| 0.10500000000006 | 0.142 | 0.979 | 3.143 |
| 0.10800000000006 | 0.147 | 1.012 | 3.242 |
| 0.11100000000006 | 0.152 | 1.044 | 3.342 |
| 0.11400000000006 | 0.158 | 1.077 | 3.442 |
| 0.11700000000006 | 0.163 | 1.11 | 3.543 |
| 0.12000000000006 | 0.169 | 1.143 | 3.645 |
| 0.12300000000006 | 0.174 | 1.177 | 3.746 |
| 0.12600000000006 | 0.18 | 1.211 | 3.849 |
| 0.12900000000006 | 0.186 | 1.245 | 3.952 |
| 0.13200000000006 | 0.191 | 1.279 | 4.055 |
| 0.13500000000006 | 0.197 | 1.314 | 4.16 |
| 0.13800000000006 | 0.203 | 1.349 | 4.264 |
| 0.14100000000006 | 0.209 | 1.384 | 4.369 |
| 0.14400000000006 | 0.216 | 1.419 | 4.475 |
| 0.14700000000006 | 0.222 | 1.455 | 4.581 |
| 0.15000000000006 | 0.228 | 1.491 | 4.688 |
| 0.15300000000006 | 0.235 | 1.527 | 4.796 |
| 0.15600000000006 | 0.241 | 1.563 | 4.904 |
| 0.15900000000006 | 0.248 | 1.6 | 5.012 |
| 0.16200000000006 | 0.254 | 1.637 | 5.122 |
| 0.16500000000006 | 0.261 | 1.674 | 5.231 |
| 0.16800000000006 | 0.268 | 1.712 | 5.342 |
| 0.17100000000006 | 0.275 | 1.75 | 5.452 |
| 0.17400000000006 | 0.282 | 1.788 | 5.564 |
| 0.17700000000006 | 0.289 | 1.826 | 5.676 |
| 0.18000000000006 | 0.296 | 1.865 | 5.788 |
| 0.18300000000006 | 0.303 | 1.904 | 5.901 |
| 0.18600000000006 | 0.31 | 1.943 | 6.015 |
| 0.18900000000006 | 0.318 | 1.982 | 6.13 |
| 0.19200000000006 | 0.325 | 2.022 | 6.244 |
| 0.19500000000006 | 0.333 | 2.062 | 6.36 |
| 0.19800000000006 | 0.34 | 2.103 | 6.476 |
| 0.20100000000006 | 0.348 | 2.143 | 6.593 |
| 0.20400000000006 | 0.356 | 2.184 | 6.71 |
| 0.20700000000006 | 0.364 | 2.225 | 6.828 |
| 0.21000000000006 | 0.372 | 2.267 | 6.946 |
| 0.21300000000006 | 0.38 | 2.308 | 7.065 |
| 0.21600000000006 | 0.388 | 2.351 | 7.185 |
| 0.21900000000006 | 0.397 | 2.393 | 7.305 |
| 0.22200000000006 | 0.405 | 2.435 | 7.426 |
| 0.22500000000006 | 0.414 | 2.478 | 7.547 |
| 0.22800000000006 | 0.422 | 2.522 | 7.669 |
| 0.23100000000006 | 0.431 | 2.565 | 7.792 |
| 0.23400000000006 | 0.44 | 2.609 | 7.915 |
| 0.23700000000006 | 0.449 | 2.653 | 8.039 |
| 0.24000000000006 | 0.458 | 2.697 | 8.163 |
| 0.24300000000006 | 0.467 | 2.742 | 8.288 |
| 0.24600000000006 | 0.476 | 2.787 | 8.414 |
| 0.24900000000006 | 0.485 | 2.832 | 8.54 |
| 0.25200000000006 | 0.495 | 2.878 | 8.667 |
| 0.25500000000006 | 0.504 | 2.924 | 8.794 |
| 0.25800000000006 | 0.514 | 2.97 | 8.922 |
| 0.26100000000006 | 0.523 | 3.017 | 9.051 |
| 0.26400000000006 | 0.533 | 3.064 | 9.18 |
| 0.26700000000006 | 0.543 | 3.111 | 9.31 |
| 0.27000000000006 | 0.553 | 3.158 | 9.441 |
| 0.27300000000006 | 0.563 | 3.206 | 9.572 |
| 0.27600000000006 | 0.573 | 3.254 | 9.704 |
| 0.27900000000006 | 0.584 | 3.302 | 9.836 |
| 0.28200000000006 | 0.594 | 3.351 | 9.969 |
| 0.28500000000006 | 0.605 | 3.4 | 10.103 |
| 0.28800000000006 | 0.615 | 3.45 | 10.237 |
| 0.29100000000006 | 0.626 | 3.499 | 10.372 |
| 0.29400000000006 | 0.637 | 3.549 | 10.508 |
| 0.29700000000006 | 0.648 | 3.599 | 10.644 |
| 0.30000000000006 | 0.659 | 3.65 | 10.781 |
| 0.30300000000006 | 0.67 | 3.701 | 10.919 |
| 0.30600000000006 | 0.682 | 3.752 | 11.057 |
| 0.30900000000006 | 0.693 | 3.804 | 11.196 |
| 0.31200000000006 | 0.705 | 3.856 | 11.335 |
| 0.31500000000006 | 0.716 | 3.908 | 11.475 |
| 0.31800000000006 | 0.728 | 3.961 | 11.616 |
| 0.32100000000006 | 0.74 | 4.014 | 11.757 |
| 0.32400000000006 | 0.752 | 4.067 | 11.899 |
| 0.32700000000006 | 0.764 | 4.12 | 12.042 |
| 0.33000000000006 | 0.776 | 4.174 | 12.186 |
| 0.33300000000006 | 0.789 | 4.229 | 12.33 |
| 0.33600000000006 | 0.801 | 4.283 | 12.474 |
| 0.33900000000006 | 0.814 | 4.338 | 12.62 |
| 0.34200000000006 | 0.827 | 4.393 | 12.766 |
| 0.34500000000006 | 0.839 | 4.449 | 12.912 |
| 0.34800000000006 | 0.852 | 4.505 | 13.06 |
| 0.35100000000006 | 0.866 | 4.561 | 13.208 |
| 0.35400000000006 | 0.879 | 4.618 | 13.356 |
| 0.35700000000006 | 0.892 | 4.675 | 13.506 |
| 0.36000000000006 | 0.906 | 4.732 | 13.656 |
| 0.36300000000006 | 0.919 | 4.79 | 13.807 |
| 0.36600000000006 | 0.933 | 4.848 | 13.958 |
| 0.36900000000006 | 0.947 | 4.906 | 14.11 |
| 0.37200000000006 | 0.961 | 4.965 | 14.263 |
| 0.37500000000006 | 0.975 | 5.024 | 14.416 |
| 0.37800000000006 | 0.989 | 5.083 | 14.57 |
| 0.38100000000006 | 1.003 | 5.143 | 14.725 |
| 0.38400000000006 | 1.018 | 5.203 | 14.881 |
| 0.38700000000006 | 1.033 | 5.263 | 15.037 |
| 0.39000000000006 | 1.047 | 5.324 | 15.194 |
| 0.39300000000006 | 1.062 | 5.385 | 15.351 |
| 0.39600000000006 | 1.077 | 5.447 | 15.51 |
| 0.39900000000006 | 1.093 | 5.509 | 15.668 |
| 0.40200000000006 | 1.108 | 5.571 | 15.828 |
| 0.40500000000006 | 1.123 | 5.634 | 15.988 |
| 0.40800000000006 | 1.139 | 5.697 | 16.149 |
| 0.41100000000006 | 1.155 | 5.76 | 16.311 |
| 0.41400000000006 | 1.17 | 5.824 | 16.474 |
| 0.41700000000006 | 1.186 | 5.888 | 16.637 |
| 0.42000000000006 | 1.203 | 5.952 | 16.801 |
| 0.42300000000006 | 1.219 | 6.017 | 16.965 |
| 0.42600000000006 | 1.235 | 6.082 | 17.131 |
| 0.42900000000006 | 1.252 | 6.148 | 17.297 |
| 0.43200000000006 | 1.269 | 6.214 | 17.463 |
| 0.43500000000006 | 1.285 | 6.28 | 17.631 |
| 0.43800000000006 | 1.302 | 6.347 | 17.799 |
| 0.44100000000006 | 1.32 | 6.414 | 17.968 |
| 0.44400000000006 | 1.337 | 6.482 | 18.137 |
| 0.44700000000006 | 1.354 | 6.55 | 18.308 |
| 0.45000000000006 | 1.372 | 6.618 | 18.479 |
| 0.45300000000006 | 1.39 | 6.686 | 18.65 |
| 0.45600000000006 | 1.408 | 6.755 | 18.823 |
| 0.45900000000006 | 1.426 | 6.825 | 18.996 |
| 0.46200000000006 | 1.444 | 6.895 | 19.17 |
| 0.46500000000006 | 1.462 | 6.965 | 19.345 |
| 0.46800000000006 | 1.481 | 7.035 | 19.52 |
| 0.47100000000006 | 1.499 | 7.106 | 19.696 |
| 0.47400000000006 | 1.518 | 7.178 | 19.873 |
| 0.47700000000006 | 1.537 | 7.249 | 20.051 |
| 0.48000000000006 | 1.556 | 7.321 | 20.229 |
| 0.48300000000006 | 1.575 | 7.394 | 20.408 |
| 0.48600000000006 | 1.595 | 7.467 | 20.588 |
| 0.48900000000006 | 1.614 | 7.54 | 20.769 |
| 0.49200000000006 | 1.634 | 7.614 | 20.95 |
| 0.49500000000006 | 1.654 | 7.688 | 21.132 |
| 0.49800000000006 | 1.674 | 7.763 | 21.315 |
| 0.50100000000006 | 1.694 | 7.838 | 21.499 |
| 0.50400000000006 | 1.715 | 7.913 | 21.683 |
| 0.50700000000006 | 1.735 | 7.989 | 21.868 |
| 0.51000000000006 | 1.756 | 8.065 | 22.054 |
| 0.51300000000006 | 1.777 | 8.141 | 22.241 |
| 0.51600000000006 | 1.798 | 8.218 | 22.428 |
| 0.51900000000006 | 1.819 | 8.296 | 22.616 |
| 0.52200000000006 | 1.84 | 8.373 | 22.805 |
| 0.52500000000006 | 1.862 | 8.452 | 22.995 |
| 0.52800000000006 | 1.884 | 8.53 | 23.186 |
| 0.53100000000006 | 1.906 | 8.609 | 23.377 |
| 0.53400000000006 | 1.928 | 8.689 | 23.569 |
| 0.53700000000006 | 1.95 | 8.769 | 23.762 |
| 0.54000000000006 | 1.972 | 8.849 | 23.955 |
| 0.54300000000006 | 1.995 | 8.93 | 24.15 |
| 0.54600000000006 | 2.018 | 9.011 | 24.345 |
| 0.54900000000006 | 2.04 | 9.092 | 24.541 |
| 0.55200000000006 | 2.064 | 9.174 | 24.738 |
| 0.55500000000006 | 2.087 | 9.257 | 24.935 |
| 0.55800000000006 | 2.11 | 9.34 | 25.133 |
| 0.56100000000006 | 2.134 | 9.423 | 25.333 |
| 0.56400000000006 | 2.158 | 9.507 | 25.532 |
| 0.56700000000006 | 2.182 | 9.591 | 25.733 |
| 0.57000000000006 | 2.206 | 9.676 | 25.935 |
| 0.57300000000006 | 2.23 | 9.761 | 26.137 |
| 0.57600000000006 | 2.255 | 9.846 | 26.34 |
| 0.57900000000006 | 2.279 | 9.932 | 26.544 |
| 0.58200000000006 | 2.304 | 10.018 | 26.749 |
| 0.58500000000006 | 2.329 | 10.105 | 26.954 |
| 0.58800000000006 | 2.355 | 10.192 | 27.16 |
| 0.59100000000006 | 2.38 | 10.28 | 27.367 |
| 0.59400000000006 | 2.406 | 10.368 | 27.575 |
| 0.59700000000006 | 2.432 | 10.457 | 27.784 |
| 0.60000000000006 | 2.458 | 10.546 | 27.994 |
| 0.60300000000006 | 2.484 | 10.635 | 28.204 |
| 0.60600000000006 | 2.51 | 10.725 | 28.415 |
| 0.60900000000006 | 2.537 | 10.815 | 28.627 |
| 0.61200000000006 | 2.564 | 10.906 | 28.84 |
| 0.61500000000006 | 2.591 | 10.997 | 29.054 |
| 0.61800000000006 | 2.618 | 11.089 | 29.268 |
| 0.62100000000006 | 2.645 | 11.181 | 29.483 |
| 0.62400000000006 | 2.673 | 11.274 | 29.7 |
| 0.62700000000006 | 2.7 | 11.367 | 29.916 |
| 0.63000000000006 | 2.728 | 11.461 | 30.134 |
| 0.63300000000006 | 2.757 | 11.555 | 30.353 |
| 0.63600000000006 | 2.785 | 11.649 | 30.572 |
| 0.63900000000006 | 2.813 | 11.744 | 30.793 |
| 0.64200000000006 | 2.842 | 11.84 | 31.014 |
| 0.64500000000006 | 2.871 | 11.935 | 31.236 |
| 0.64800000000006 | 2.9 | 12.032 | 31.459 |
| 0.65100000000006 | 2.93 | 12.129 | 31.682 |
| 0.65400000000006 | 2.959 | 12.226 | 31.907 |
| 0.65700000000006 | 2.989 | 12.324 | 32.132 |
| 0.66000000000006 | 3.019 | 12.422 | 32.358 |
| 0.66300000000006 | 3.049 | 12.521 | 32.585 |
| 0.66600000000006 | 3.08 | 12.62 | 32.813 |
| 0.66900000000006 | 3.11 | 12.72 | 33.042 |
| 0.67200000000006 | 3.141 | 12.82 | 33.272 |
| 0.67500000000006 | 3.172 | 12.92 | 33.502 |
| 0.67800000000006 | 3.203 | 13.022 | 33.734 |
| 0.68100000000006 | 3.235 | 13.123 | 33.966 |
| 0.68400000000006 | 3.266 | 13.225 | 34.199 |
| 0.68700000000006 | 3.298 | 13.328 | 34.433 |
| 0.69000000000006 | 3.33 | 13.431 | 34.668 |
| 0.69300000000006 | 3.363 | 13.535 | 34.904 |
| 0.69600000000006 | 3.395 | 13.639 | 35.14 |
| 0.69900000000006 | 3.428 | 13.743 | 35.378 |
| 0.70200000000006 | 3.461 | 13.848 | 35.616 |
| 0.70500000000006 | 3.494 | 13.954 | 35.855 |
| 0.70800000000006 | 3.528 | 14.06 | 36.095 |
| 0.71100000000006 | 3.561 | 14.166 | 36.336 |
| 0.71400000000006 | 3.595 | 14.273 | 36.578 |
| 0.71700000000006 | 3.629 | 14.381 | 36.821 |
| 0.72000000000006 | 3.664 | 14.489 | 37.065 |
| 0.72300000000006 | 3.698 | 14.598 | 37.309 |
| 0.72600000000006 | 3.733 | 14.707 | 37.555 |
| 0.72900000000006 | 3.768 | 14.816 | 37.801 |
| 0.73200000000006 | 3.803 | 14.926 | 38.048 |
| 0.73500000000006 | 3.839 | 15.037 | 38.297 |
| 0.73800000000006 | 3.874 | 15.148 | 38.546 |
| 0.74100000000006 | 3.91 | 15.26 | 38.795 |
| 0.74400000000006 | 3.947 | 15.372 | 39.046 |
| 0.74700000000006 | 3.983 | 15.484 | 39.298 |
| 0.75000000000006 | 4.02 | 15.598 | 39.551 |
| 0.75300000000006 | 4.056 | 15.711 | 39.804 |
| 0.75600000000006 | 4.094 | 15.826 | 40.059 |
| 0.75900000000006 | 4.131 | 15.94 | 40.314 |
| 0.76200000000006 | 4.168 | 16.056 | 40.571 |
| 0.76500000000006 | 4.206 | 16.171 | 40.828 |
| 0.76800000000006 | 4.244 | 16.288 | 41.086 |
| 0.77100000000006 | 4.283 | 16.405 | 41.345 |
| 0.77400000000006 | 4.321 | 16.522 | 41.605 |
| 0.77700000000006 | 4.36 | 16.64 | 41.866 |
| 0.78000000000006 | 4.399 | 16.758 | 42.128 |
| 0.78300000000006 | 4.438 | 16.877 | 42.391 |
| 0.78600000000006 | 4.478 | 16.997 | 42.654 |
| 0.78900000000006 | 4.518 | 17.117 | 42.919 |
| 0.79200000000006 | 4.558 | 17.237 | 43.185 |
| 0.79500000000006 | 4.598 | 17.359 | 43.451 |
| 0.79800000000006 | 4.638 | 17.48 | 43.719 |
| 0.80100000000006 | 4.679 | 17.602 | 43.987 |
| 0.80400000000006 | 4.72 | 17.725 | 44.257 |
| 0.80700000000006 | 4.762 | 17.848 | 44.527 |
| 0.81000000000006 | 4.803 | 17.972 | 44.798 |
| 0.81300000000006 | 4.845 | 18.097 | 45.07 |
| 0.81600000000006 | 4.887 | 18.222 | 45.344 |
| 0.81900000000006 | 4.929 | 18.347 | 45.618 |
| 0.82200000000006 | 4.972 | 18.473 | 45.893 |
| 0.82500000000006 | 5.015 | 18.6 | 46.169 |
| 0.82800000000006 | 5.058 | 18.727 | 46.446 |
| 0.83100000000006 | 5.101 | 18.855 | 46.724 |
| 0.83400000000006 | 5.145 | 18.983 | 47.003 |
| 0.83700000000006 | 5.189 | 19.112 | 47.283 |
| 0.84000000000006 | 5.233 | 19.241 | 47.563 |
| 0.84300000000006 | 5.277 | 19.371 | 47.845 |
| 0.84600000000006 | 5.322 | 19.502 | 48.128 |
| 0.84900000000006 | 5.367 | 19.633 | 48.412 |
| 0.85200000000006 | 5.412 | 19.765 | 48.697 |
| 0.85500000000006 | 5.458 | 19.897 | 48.982 |
| 0.85800000000006 | 5.503 | 20.03 | 49.269 |
| 0.86100000000006 | 5.549 | 20.163 | 49.557 |
| 0.86400000000006 | 5.596 | 20.297 | 49.845 |
| 0.86700000000006 | 5.642 | 20.432 | 50.135 |
| 0.87000000000006 | 5.689 | 20.567 | 50.426 |
| 0.87300000000006 | 5.736 | 20.702 | 50.717 |
| 0.87600000000006 | 5.784 | 20.839 | 51.01 |
| 0.87900000000006 | 5.831 | 20.976 | 51.304 |
| 0.88200000000006 | 5.879 | 21.113 | 51.598 |
| 0.88500000000006 | 5.928 | 21.251 | 51.894 |
| 0.88800000000006 | 5.976 | 21.39 | 52.191 |
| 0.89100000000006 | 6.025 | 21.529 | 52.488 |
| 0.89400000000006 | 6.074 | 21.669 | 52.787 |
| 0.89700000000006 | 6.123 | 21.809 | 53.086 |
| 0.90000000000006 | 6.173 | 21.95 | 53.387 |
| 0.90300000000006 | 6.223 | 22.092 | 53.689 |
| 0.90600000000006 | 6.273 | 22.234 | 53.991 |
| 0.90900000000006 | 6.324 | 22.377 | 54.295 |
| 0.91200000000006 | 6.375 | 22.52 | 54.6 |
| 0.91500000000006 | 6.426 | 22.664 | 54.906 |
| 0.91800000000006 | 6.477 | 22.809 | 55.212 |
| 0.92100000000006 | 6.529 | 22.954 | 55.52 |
| 0.92400000000006 | 6.581 | 23.1 | 55.829 |
| 0.92700000000006 | 6.633 | 23.246 | 56.139 |
| 0.93000000000006 | 6.686 | 23.393 | 56.45 |
| 0.93300000000006 | 6.739 | 23.541 | 56.761 |
| 0.93600000000006 | 6.792 | 23.689 | 57.074 |
| 0.93900000000006 | 6.845 | 23.838 | 57.388 |
| 0.94200000000006 | 6.899 | 23.987 | 57.703 |
| 0.94500000000006 | 6.953 | 24.137 | 58.019 |
| 0.94800000000006 | 7.008 | 24.288 | 58.336 |
| 0.95100000000006 | 7.062 | 24.439 | 58.655 |
| 0.95400000000006 | 7.117 | 24.591 | 58.974 |
| 0.95700000000006 | 7.173 | 24.744 | 59.294 |
| 0.96000000000006 | 7.228 | 24.897 | 59.615 |
| 0.96300000000006 | 7.284 | 25.051 | 59.937 |
| 0.96600000000006 | 7.341 | 25.205 | 60.261 |
| 0.96900000000006 | 7.397 | 25.36 | 60.585 |
| 0.97200000000006 | 7.454 | 25.516 | 60.911 |
| 0.97500000000006 | 7.511 | 25.672 | 61.237 |
| 0.97800000000006 | 7.569 | 25.829 | 61.565 |
| 0.98100000000006 | 7.626 | 25.987 | 61.894 |
| 0.98400000000006 | 7.685 | 26.145 | 62.223 |
| 0.98700000000006 | 7.743 | 26.304 | 62.554 |
| 0.99000000000006 | 7.802 | 26.464 | 62.886 |
| 0.99300000000006 | 7.861 | 26.624 | 63.219 |
| 0.99600000000006 | 7.92 | 26.785 | 63.553 |
| 0.99900000000006 | 7.98 | 26.946 | 63.888 |
| 1.00200000000006 | 8.04 | 27.108 | 64.224 |
| 1.00500000000006 | 8.1 | 27.271 | 64.562 |
| 1.00800000000006 | 8.161 | 27.434 | 64.9 |
| 1.01100000000006 | 8.222 | 27.598 | 65.239 |
| 1.01400000000006 | 8.284 | 27.763 | 65.58 |
| 1.01700000000006 | 8.345 | 27.928 | 65.921 |
| 1.02000000000006 | 8.407 | 28.094 | 66.264 |
| 1.023000000000059 | 8.47 | 28.261 | 66.608 |
| 1.026000000000059 | 8.532 | 28.429 | 66.953 |
| 1.029000000000059 | 8.595 | 28.597 | 67.299 |
| 1.03200000000006 | 8.659 | 28.765 | 67.646 |
| 1.035000000000059 | 8.722 | 28.935 | 67.994 |
| 1.038000000000059 | 8.786 | 29.105 | 68.343 |
| 1.041000000000059 | 8.851 | 29.275 | 68.694 |
| 1.044000000000059 | 8.915 | 29.447 | 69.045 |
| 1.047000000000059 | 8.98 | 29.619 | 69.398 |
| 1.050000000000058 | 9.046 | 29.791 | 69.752 |
| 1.053000000000058 | 9.112 | 29.965 | 70.106 |
| 1.056000000000058 | 9.178 | 30.139 | 70.462 |
| 1.059000000000058 | 9.244 | 30.313 | 70.82 |
| 1.062000000000058 | 9.311 | 30.489 | 71.178 |
| 1.065000000000058 | 9.378 | 30.665 | 71.537 |
| 1.068000000000058 | 9.445 | 30.842 | 71.898 |
| 1.071000000000058 | 9.513 | 31.019 | 72.259 |
| 1.074000000000058 | 9.581 | 31.197 | 72.622 |
| 1.077000000000057 | 9.65 | 31.376 | 72.986 |
| 1.080000000000057 | 9.719 | 31.556 | 73.351 |
| 1.083000000000057 | 9.788 | 31.736 | 73.717 |
| 1.086000000000057 | 9.858 | 31.917 | 74.084 |
| 1.089000000000057 | 9.928 | 32.098 | 74.452 |
| 1.092000000000057 | 9.998 | 32.281 | 74.822 |
| 1.095000000000057 | 10.069 | 32.464 | 75.193 |
| 1.098000000000057 | 10.14 | 32.647 | 75.565 |
| 1.101000000000057 | 10.211 | 32.832 | 75.938 |
| 1.104000000000056 | 10.283 | 33.017 | 76.312 |
| 1.107000000000056 | 10.355 | 33.203 | 76.687 |
| 1.110000000000056 | 10.427 | 33.389 | 77.063 |
| 1.113000000000056 | 10.5 | 33.576 | 77.441 |
| 1.116000000000056 | 10.573 | 33.764 | 77.82 |
| 1.119000000000056 | 10.647 | 33.953 | 78.2 |
| 1.122000000000056 | 10.721 | 34.142 | 78.581 |
| 1.125000000000056 | 10.795 | 34.332 | 78.963 |
| 1.128000000000056 | 10.87 | 34.523 | 79.347 |
| 1.131000000000056 | 10.945 | 34.715 | 79.731 |
| 1.134000000000055 | 11.02 | 34.907 | 80.117 |
| 1.137000000000055 | 11.096 | 35.1 | 80.504 |
| 1.140000000000055 | 11.172 | 35.293 | 80.892 |
| 1.143000000000055 | 11.249 | 35.488 | 81.281 |
| 1.146000000000055 | 11.326 | 35.683 | 81.672 |
| 1.149000000000055 | 11.403 | 35.879 | 82.064 |
| 1.152000000000055 | 11.481 | 36.075 | 82.456 |
| 1.155000000000055 | 11.559 | 36.273 | 82.85 |
| 1.158000000000055 | 11.638 | 36.471 | 83.246 |
| 1.161000000000054 | 11.716 | 36.67 | 83.642 |
| 1.164000000000054 | 11.796 | 36.869 | 84.04 |
| 1.167000000000054 | 11.875 | 37.069 | 84.439 |
| 1.170000000000054 | 11.955 | 37.27 | 84.839 |
| 1.173000000000054 | 12.036 | 37.472 | 85.24 |
| 1.176000000000054 | 12.117 | 37.675 | 85.642 |
| 1.179000000000054 | 12.198 | 37.878 | 86.046 |
| 1.182000000000054 | 12.28 | 38.082 | 86.451 |
| 1.185000000000054 | 12.362 | 38.287 | 86.857 |
| 1.188000000000053 | 12.444 | 38.492 | 87.264 |
| 1.191000000000053 | 12.527 | 38.698 | 87.673 |
| 1.194000000000053 | 12.61 | 38.905 | 88.082 |
| 1.197000000000053 | 12.694 | 39.113 | 88.493 |
| 1.200000000000053 | 12.778 | 39.322 | 88.906 |
| 1.203000000000053 | 12.862 | 39.531 | 89.319 |
| 1.206000000000053 | 12.947 | 39.741 | 89.734 |
| 1.209000000000053 | 13.032 | 39.952 | 90.149 |
| 1.212000000000053 | 13.118 | 40.163 | 90.567 |
| 1.215000000000052 | 13.204 | 40.376 | 90.985 |
| 1.218000000000052 | 13.29 | 40.589 | 91.404 |
| 1.221000000000052 | 13.377 | 40.803 | 91.825 |
| 1.224000000000052 | 13.464 | 41.017 | 92.247 |
| 1.227000000000052 | 13.552 | 41.233 | 92.67 |
| 1.230000000000052 | 13.64 | 41.449 | 93.095 |
| 1.233000000000052 | 13.729 | 41.666 | 93.521 |
| 1.236000000000052 | 13.818 | 41.884 | 93.948 |
| 1.239000000000052 | 13.907 | 42.102 | 94.376 |
| 1.242000000000051 | 13.997 | 42.321 | 94.806 |
| 1.245000000000051 | 14.087 | 42.542 | 95.236 |
| 1.248000000000051 | 14.178 | 42.762 | 95.668 |
| 1.251000000000051 | 14.269 | 42.984 | 96.102 |
| 1.254000000000051 | 14.36 | 43.207 | 96.536 |
| 1.257000000000051 | 14.452 | 43.43 | 96.972 |
| 1.260000000000051 | 14.544 | 43.654 | 97.409 |
| 1.263000000000051 | 14.637 | 43.879 | 97.847 |
| 1.266000000000051 | 14.73 | 44.104 | 98.287 |
| 1.269000000000051 | 14.824 | 44.331 | 98.728 |
| 1.27200000000005 | 14.918 | 44.558 | 99.17 |
| 1.27500000000005 | 15.013 | 44.786 | 99.614 |
| 1.27800000000005 | 15.107 | 45.015 | 100.058 |
| 1.28100000000005 | 15.203 | 45.245 | 100.504 |
| 1.28400000000005 | 15.299 | 45.475 | 100.952 |
| 1.28700000000005 | 15.395 | 45.706 | 101.4 |
| 1.29000000000005 | 15.492 | 45.939 | 101.85 |
| 1.29300000000005 | 15.589 | 46.171 | 102.301 |
| 1.29600000000005 | 15.686 | 46.405 | 102.754 |
| 1.299000000000049 | 15.784 | 46.64 | 103.208 |
| 1.302000000000049 | 15.883 | 46.875 | 103.663 |
| 1.305000000000049 | 15.982 | 47.111 | 104.119 |
| 1.30800000000005 | 16.081 | 47.348 | 104.577 |
| 1.311000000000049 | 16.181 | 47.586 | 105.036 |
| 1.314000000000049 | 16.281 | 47.825 | 105.496 |
| 1.317000000000049 | 16.382 | 48.064 | 105.958 |
| 1.320000000000049 | 16.483 | 48.305 | 106.42 |
| 1.323000000000049 | 16.585 | 48.546 | 106.885 |
| 1.326000000000048 | 16.687 | 48.788 | 107.35 |
| 1.329000000000048 | 16.789 | 49.031 | 107.817 |
| 1.332000000000048 | 16.892 | 49.274 | 108.285 |
| 1.335000000000048 | 16.996 | 49.519 | 108.755 |
| 1.338000000000048 | 17.1 | 49.764 | 109.226 |
| 1.341000000000048 | 17.204 | 50.01 | 109.698 |
| 1.344000000000048 | 17.309 | 50.257 | 110.171 |
| 1.347000000000048 | 17.414 | 50.505 | 110.646 |
| 1.350000000000048 | 17.52 | 50.754 | 111.122 |
| 1.353000000000047 | 17.626 | 51.003 | 111.6 |
| 1.356000000000047 | 17.733 | 51.254 | 112.079 |
| 1.359000000000047 | 17.84 | 51.505 | 112.559 |
| 1.362000000000047 | 17.948 | 51.757 | 113.041 |
| 1.365000000000047 | 18.056 | 52.01 | 113.523 |
| 1.368000000000047 | 18.165 | 52.264 | 114.008 |
| 1.371000000000047 | 18.274 | 52.519 | 114.493 |
| 1.374000000000047 | 18.384 | 52.774 | 114.98 |
| 1.377000000000047 | 18.494 | 53.031 | 115.469 |
| 1.380000000000046 | 18.604 | 53.288 | 115.958 |
| 1.383000000000046 | 18.715 | 53.546 | 116.449 |
| 1.386000000000046 | 18.827 | 53.805 | 116.942 |
| 1.389000000000046 | 18.939 | 54.065 | 117.435 |
| 1.392000000000046 | 19.051 | 54.326 | 117.931 |
| 1.395000000000046 | 19.164 | 54.588 | 118.427 |
| 1.398000000000046 | 19.278 | 54.85 | 118.925 |
| 1.401000000000046 | 19.392 | 55.114 | 119.424 |
| 1.404000000000046 | 19.506 | 55.378 | 119.925 |
| 1.407000000000046 | 19.621 | 55.643 | 120.427 |
| 1.410000000000045 | 19.737 | 55.909 | 120.93 |
| 1.413000000000045 | 19.852 | 56.176 | 121.435 |
| 1.416000000000045 | 19.969 | 56.444 | 121.941 |
| 1.419000000000045 | 20.086 | 56.713 | 122.449 |
| 1.422000000000045 | 20.203 | 56.982 | 122.958 |
| 1.425000000000045 | 20.321 | 57.253 | 123.468 |
| 1.428000000000045 | 20.44 | 57.524 | 123.98 |
| 1.431000000000045 | 20.559 | 57.797 | 124.493 |
| 1.434000000000045 | 20.678 | 58.07 | 125.008 |
| 1.437000000000044 | 20.798 | 58.344 | 125.524 |
| 1.440000000000044 | 20.919 | 58.619 | 126.041 |
| 1.443000000000044 | 21.04 | 58.895 | 126.56 |
| 1.446000000000044 | 21.161 | 59.172 | 127.08 |
| 1.449000000000044 | 21.283 | 59.449 | 127.601 |
| 1.452000000000044 | 21.406 | 59.728 | 128.124 |
| 1.455000000000044 | 21.529 | 60.008 | 128.649 |
| 1.458000000000044 | 21.652 | 60.288 | 129.175 |
| 1.461000000000044 | 21.776 | 60.57 | 129.702 |
| 1.464000000000043 | 21.901 | 60.852 | 130.231 |
| 1.467000000000043 | 22.026 | 61.135 | 130.761 |
| 1.470000000000043 | 22.152 | 61.419 | 131.292 |
| 1.473000000000043 | 22.278 | 61.705 | 131.826 |
| 1.476000000000043 | 22.405 | 61.991 | 132.36 |
| 1.479000000000043 | 22.532 | 62.278 | 132.896 |
| 1.482000000000043 | 22.66 | 62.565 | 133.433 |
| 1.485000000000043 | 22.788 | 62.854 | 133.972 |
| 1.488000000000043 | 22.917 | 63.144 | 134.512 |
| 1.491000000000042 | 23.046 | 63.435 | 135.054 |
| 1.494000000000042 | 23.176 | 63.726 | 135.597 |
| 1.497000000000042 | 23.307 | 64.019 | 136.141 |
| 1.500000000000042 | 23.438 | 64.313 | 136.688 |